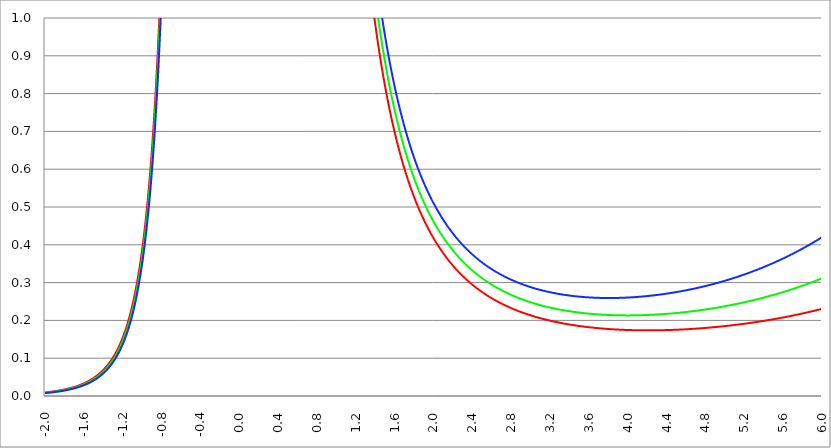
| Category | Series 1 | Series 0 | Series 2 |
|---|---|---|---|
| -2.0 | 0.009 | 0.008 | 0.008 |
| -1.996 | 0.009 | 0.009 | 0.008 |
| -1.992 | 0.01 | 0.009 | 0.008 |
| -1.988 | 0.01 | 0.009 | 0.008 |
| -1.984 | 0.01 | 0.009 | 0.008 |
| -1.98 | 0.01 | 0.009 | 0.008 |
| -1.976 | 0.01 | 0.009 | 0.008 |
| -1.972 | 0.01 | 0.009 | 0.008 |
| -1.968 | 0.01 | 0.009 | 0.008 |
| -1.964 | 0.01 | 0.009 | 0.009 |
| -1.96 | 0.011 | 0.01 | 0.009 |
| -1.956 | 0.011 | 0.01 | 0.009 |
| -1.952 | 0.011 | 0.01 | 0.009 |
| -1.948 | 0.011 | 0.01 | 0.009 |
| -1.944 | 0.011 | 0.01 | 0.009 |
| -1.94 | 0.011 | 0.01 | 0.009 |
| -1.936 | 0.011 | 0.01 | 0.009 |
| -1.932 | 0.011 | 0.01 | 0.009 |
| -1.928 | 0.012 | 0.011 | 0.01 |
| -1.924 | 0.012 | 0.011 | 0.01 |
| -1.92 | 0.012 | 0.011 | 0.01 |
| -1.916 | 0.012 | 0.011 | 0.01 |
| -1.912 | 0.012 | 0.011 | 0.01 |
| -1.908 | 0.012 | 0.011 | 0.01 |
| -1.904 | 0.012 | 0.011 | 0.01 |
| -1.9 | 0.013 | 0.011 | 0.01 |
| -1.896 | 0.013 | 0.012 | 0.011 |
| -1.892 | 0.013 | 0.012 | 0.011 |
| -1.888 | 0.013 | 0.012 | 0.011 |
| -1.884 | 0.013 | 0.012 | 0.011 |
| -1.88 | 0.013 | 0.012 | 0.011 |
| -1.876 | 0.014 | 0.012 | 0.011 |
| -1.872 | 0.014 | 0.013 | 0.011 |
| -1.868 | 0.014 | 0.013 | 0.012 |
| -1.864 | 0.014 | 0.013 | 0.012 |
| -1.86 | 0.014 | 0.013 | 0.012 |
| -1.856 | 0.014 | 0.013 | 0.012 |
| -1.852 | 0.015 | 0.013 | 0.012 |
| -1.848 | 0.015 | 0.014 | 0.012 |
| -1.844 | 0.015 | 0.014 | 0.012 |
| -1.84 | 0.015 | 0.014 | 0.013 |
| -1.836 | 0.015 | 0.014 | 0.013 |
| -1.832 | 0.016 | 0.014 | 0.013 |
| -1.828 | 0.016 | 0.014 | 0.013 |
| -1.824 | 0.016 | 0.015 | 0.013 |
| -1.82 | 0.016 | 0.015 | 0.013 |
| -1.816 | 0.016 | 0.015 | 0.014 |
| -1.812 | 0.017 | 0.015 | 0.014 |
| -1.808 | 0.017 | 0.015 | 0.014 |
| -1.804 | 0.017 | 0.016 | 0.014 |
| -1.8 | 0.017 | 0.016 | 0.014 |
| -1.796 | 0.017 | 0.016 | 0.015 |
| -1.792 | 0.018 | 0.016 | 0.015 |
| -1.788 | 0.018 | 0.016 | 0.015 |
| -1.784 | 0.018 | 0.017 | 0.015 |
| -1.78 | 0.018 | 0.017 | 0.015 |
| -1.776 | 0.019 | 0.017 | 0.016 |
| -1.772 | 0.019 | 0.017 | 0.016 |
| -1.768 | 0.019 | 0.017 | 0.016 |
| -1.764 | 0.019 | 0.018 | 0.016 |
| -1.76 | 0.02 | 0.018 | 0.016 |
| -1.756 | 0.02 | 0.018 | 0.017 |
| -1.752 | 0.02 | 0.018 | 0.017 |
| -1.748 | 0.02 | 0.019 | 0.017 |
| -1.744 | 0.021 | 0.019 | 0.017 |
| -1.74 | 0.021 | 0.019 | 0.018 |
| -1.736 | 0.021 | 0.019 | 0.018 |
| -1.732 | 0.021 | 0.02 | 0.018 |
| -1.728 | 0.022 | 0.02 | 0.018 |
| -1.724 | 0.022 | 0.02 | 0.019 |
| -1.72 | 0.022 | 0.02 | 0.019 |
| -1.716 | 0.023 | 0.021 | 0.019 |
| -1.712 | 0.023 | 0.021 | 0.019 |
| -1.708 | 0.023 | 0.021 | 0.02 |
| -1.704 | 0.024 | 0.022 | 0.02 |
| -1.7 | 0.024 | 0.022 | 0.02 |
| -1.696 | 0.024 | 0.022 | 0.02 |
| -1.692 | 0.024 | 0.022 | 0.021 |
| -1.688 | 0.025 | 0.023 | 0.021 |
| -1.684 | 0.025 | 0.023 | 0.021 |
| -1.68 | 0.025 | 0.023 | 0.022 |
| -1.676 | 0.026 | 0.024 | 0.022 |
| -1.672 | 0.026 | 0.024 | 0.022 |
| -1.668 | 0.026 | 0.024 | 0.022 |
| -1.664 | 0.027 | 0.025 | 0.023 |
| -1.66 | 0.027 | 0.025 | 0.023 |
| -1.656 | 0.028 | 0.025 | 0.023 |
| -1.652 | 0.028 | 0.026 | 0.024 |
| -1.648 | 0.028 | 0.026 | 0.024 |
| -1.644 | 0.029 | 0.026 | 0.024 |
| -1.64 | 0.029 | 0.027 | 0.025 |
| -1.636 | 0.03 | 0.027 | 0.025 |
| -1.632 | 0.03 | 0.028 | 0.025 |
| -1.628 | 0.03 | 0.028 | 0.026 |
| -1.624 | 0.031 | 0.028 | 0.026 |
| -1.62 | 0.031 | 0.029 | 0.026 |
| -1.616 | 0.032 | 0.029 | 0.027 |
| -1.612 | 0.032 | 0.03 | 0.027 |
| -1.608 | 0.032 | 0.03 | 0.028 |
| -1.604 | 0.033 | 0.03 | 0.028 |
| -1.6 | 0.033 | 0.031 | 0.028 |
| -1.596 | 0.034 | 0.031 | 0.029 |
| -1.592 | 0.034 | 0.032 | 0.029 |
| -1.588 | 0.035 | 0.032 | 0.03 |
| -1.584 | 0.035 | 0.033 | 0.03 |
| -1.58 | 0.036 | 0.033 | 0.031 |
| -1.576 | 0.036 | 0.034 | 0.031 |
| -1.572 | 0.037 | 0.034 | 0.031 |
| -1.568 | 0.037 | 0.034 | 0.032 |
| -1.564 | 0.038 | 0.035 | 0.032 |
| -1.56 | 0.038 | 0.035 | 0.033 |
| -1.556 | 0.039 | 0.036 | 0.033 |
| -1.552 | 0.039 | 0.037 | 0.034 |
| -1.548 | 0.04 | 0.037 | 0.034 |
| -1.544 | 0.041 | 0.038 | 0.035 |
| -1.54 | 0.041 | 0.038 | 0.035 |
| -1.536 | 0.042 | 0.039 | 0.036 |
| -1.532 | 0.042 | 0.039 | 0.036 |
| -1.528 | 0.043 | 0.04 | 0.037 |
| -1.524 | 0.044 | 0.04 | 0.037 |
| -1.52 | 0.044 | 0.041 | 0.038 |
| -1.516 | 0.045 | 0.042 | 0.039 |
| -1.512 | 0.045 | 0.042 | 0.039 |
| -1.508 | 0.046 | 0.043 | 0.04 |
| -1.504 | 0.047 | 0.043 | 0.04 |
| -1.5 | 0.048 | 0.044 | 0.041 |
| -1.496 | 0.048 | 0.045 | 0.042 |
| -1.492 | 0.049 | 0.045 | 0.042 |
| -1.488 | 0.05 | 0.046 | 0.043 |
| -1.484 | 0.05 | 0.047 | 0.043 |
| -1.48 | 0.051 | 0.047 | 0.044 |
| -1.476 | 0.052 | 0.048 | 0.045 |
| -1.472 | 0.053 | 0.049 | 0.045 |
| -1.467999999999999 | 0.053 | 0.05 | 0.046 |
| -1.463999999999999 | 0.054 | 0.05 | 0.047 |
| -1.459999999999999 | 0.055 | 0.051 | 0.048 |
| -1.455999999999999 | 0.056 | 0.052 | 0.048 |
| -1.451999999999999 | 0.057 | 0.053 | 0.049 |
| -1.447999999999999 | 0.057 | 0.053 | 0.05 |
| -1.443999999999999 | 0.058 | 0.054 | 0.05 |
| -1.439999999999999 | 0.059 | 0.055 | 0.051 |
| -1.435999999999999 | 0.06 | 0.056 | 0.052 |
| -1.431999999999999 | 0.061 | 0.057 | 0.053 |
| -1.427999999999999 | 0.062 | 0.058 | 0.054 |
| -1.423999999999999 | 0.063 | 0.059 | 0.055 |
| -1.419999999999999 | 0.064 | 0.059 | 0.055 |
| -1.415999999999999 | 0.065 | 0.06 | 0.056 |
| -1.411999999999999 | 0.066 | 0.061 | 0.057 |
| -1.407999999999999 | 0.067 | 0.062 | 0.058 |
| -1.403999999999999 | 0.068 | 0.063 | 0.059 |
| -1.399999999999999 | 0.069 | 0.064 | 0.06 |
| -1.395999999999999 | 0.07 | 0.065 | 0.061 |
| -1.391999999999999 | 0.071 | 0.066 | 0.062 |
| -1.387999999999999 | 0.072 | 0.067 | 0.063 |
| -1.383999999999999 | 0.073 | 0.068 | 0.064 |
| -1.379999999999999 | 0.074 | 0.069 | 0.065 |
| -1.375999999999999 | 0.075 | 0.07 | 0.066 |
| -1.371999999999999 | 0.077 | 0.072 | 0.067 |
| -1.367999999999999 | 0.078 | 0.073 | 0.068 |
| -1.363999999999999 | 0.079 | 0.074 | 0.069 |
| -1.359999999999999 | 0.08 | 0.075 | 0.07 |
| -1.355999999999999 | 0.082 | 0.076 | 0.071 |
| -1.351999999999999 | 0.083 | 0.077 | 0.072 |
| -1.347999999999999 | 0.084 | 0.079 | 0.074 |
| -1.343999999999999 | 0.085 | 0.08 | 0.075 |
| -1.339999999999999 | 0.087 | 0.081 | 0.076 |
| -1.335999999999999 | 0.088 | 0.083 | 0.077 |
| -1.331999999999999 | 0.09 | 0.084 | 0.078 |
| -1.327999999999999 | 0.091 | 0.085 | 0.08 |
| -1.323999999999999 | 0.093 | 0.087 | 0.081 |
| -1.319999999999999 | 0.094 | 0.088 | 0.082 |
| -1.315999999999999 | 0.096 | 0.089 | 0.084 |
| -1.311999999999999 | 0.097 | 0.091 | 0.085 |
| -1.307999999999999 | 0.099 | 0.092 | 0.087 |
| -1.303999999999999 | 0.1 | 0.094 | 0.088 |
| -1.299999999999999 | 0.102 | 0.095 | 0.089 |
| -1.295999999999999 | 0.103 | 0.097 | 0.091 |
| -1.291999999999999 | 0.105 | 0.099 | 0.092 |
| -1.287999999999999 | 0.107 | 0.1 | 0.094 |
| -1.283999999999999 | 0.109 | 0.102 | 0.096 |
| -1.279999999999999 | 0.11 | 0.104 | 0.097 |
| -1.275999999999999 | 0.112 | 0.105 | 0.099 |
| -1.271999999999999 | 0.114 | 0.107 | 0.1 |
| -1.267999999999999 | 0.116 | 0.109 | 0.102 |
| -1.263999999999999 | 0.118 | 0.111 | 0.104 |
| -1.259999999999999 | 0.12 | 0.113 | 0.106 |
| -1.255999999999999 | 0.122 | 0.114 | 0.107 |
| -1.251999999999999 | 0.124 | 0.116 | 0.109 |
| -1.247999999999999 | 0.126 | 0.118 | 0.111 |
| -1.243999999999999 | 0.128 | 0.12 | 0.113 |
| -1.239999999999999 | 0.13 | 0.122 | 0.115 |
| -1.235999999999999 | 0.132 | 0.124 | 0.117 |
| -1.231999999999999 | 0.135 | 0.127 | 0.119 |
| -1.227999999999999 | 0.137 | 0.129 | 0.121 |
| -1.223999999999999 | 0.139 | 0.131 | 0.123 |
| -1.219999999999999 | 0.142 | 0.133 | 0.125 |
| -1.215999999999999 | 0.144 | 0.136 | 0.128 |
| -1.211999999999999 | 0.147 | 0.138 | 0.13 |
| -1.207999999999999 | 0.149 | 0.14 | 0.132 |
| -1.203999999999999 | 0.152 | 0.143 | 0.134 |
| -1.199999999999999 | 0.154 | 0.145 | 0.137 |
| -1.195999999999999 | 0.157 | 0.148 | 0.139 |
| -1.191999999999999 | 0.16 | 0.15 | 0.142 |
| -1.187999999999999 | 0.162 | 0.153 | 0.144 |
| -1.183999999999999 | 0.165 | 0.156 | 0.147 |
| -1.179999999999999 | 0.168 | 0.158 | 0.149 |
| -1.175999999999999 | 0.171 | 0.161 | 0.152 |
| -1.171999999999999 | 0.174 | 0.164 | 0.155 |
| -1.167999999999999 | 0.177 | 0.167 | 0.158 |
| -1.163999999999999 | 0.18 | 0.17 | 0.16 |
| -1.159999999999999 | 0.183 | 0.173 | 0.163 |
| -1.155999999999999 | 0.187 | 0.176 | 0.166 |
| -1.151999999999999 | 0.19 | 0.179 | 0.169 |
| -1.147999999999999 | 0.193 | 0.183 | 0.172 |
| -1.143999999999999 | 0.197 | 0.186 | 0.176 |
| -1.139999999999999 | 0.2 | 0.189 | 0.179 |
| -1.135999999999999 | 0.204 | 0.193 | 0.182 |
| -1.131999999999999 | 0.208 | 0.196 | 0.186 |
| -1.127999999999999 | 0.212 | 0.2 | 0.189 |
| -1.123999999999999 | 0.215 | 0.204 | 0.192 |
| -1.119999999999999 | 0.219 | 0.207 | 0.196 |
| -1.115999999999999 | 0.223 | 0.211 | 0.2 |
| -1.111999999999999 | 0.227 | 0.215 | 0.203 |
| -1.107999999999999 | 0.232 | 0.219 | 0.207 |
| -1.103999999999999 | 0.236 | 0.223 | 0.211 |
| -1.099999999999999 | 0.24 | 0.227 | 0.215 |
| -1.095999999999999 | 0.245 | 0.232 | 0.219 |
| -1.091999999999999 | 0.249 | 0.236 | 0.223 |
| -1.087999999999999 | 0.254 | 0.24 | 0.228 |
| -1.083999999999999 | 0.259 | 0.245 | 0.232 |
| -1.079999999999999 | 0.263 | 0.25 | 0.236 |
| -1.075999999999999 | 0.268 | 0.254 | 0.241 |
| -1.071999999999999 | 0.273 | 0.259 | 0.246 |
| -1.067999999999999 | 0.279 | 0.264 | 0.25 |
| -1.063999999999999 | 0.284 | 0.269 | 0.255 |
| -1.059999999999999 | 0.289 | 0.274 | 0.26 |
| -1.055999999999999 | 0.295 | 0.28 | 0.265 |
| -1.051999999999999 | 0.301 | 0.285 | 0.271 |
| -1.047999999999999 | 0.306 | 0.291 | 0.276 |
| -1.043999999999999 | 0.312 | 0.296 | 0.281 |
| -1.039999999999999 | 0.318 | 0.302 | 0.287 |
| -1.035999999999999 | 0.324 | 0.308 | 0.293 |
| -1.031999999999999 | 0.331 | 0.314 | 0.298 |
| -1.027999999999999 | 0.337 | 0.32 | 0.304 |
| -1.023999999999999 | 0.344 | 0.327 | 0.31 |
| -1.019999999999999 | 0.351 | 0.333 | 0.317 |
| -1.015999999999999 | 0.357 | 0.34 | 0.323 |
| -1.011999999999999 | 0.365 | 0.347 | 0.329 |
| -1.007999999999999 | 0.372 | 0.353 | 0.336 |
| -1.003999999999999 | 0.379 | 0.361 | 0.343 |
| -0.999999999999999 | 0.387 | 0.368 | 0.35 |
| -0.995999999999999 | 0.394 | 0.375 | 0.357 |
| -0.991999999999999 | 0.402 | 0.383 | 0.364 |
| -0.987999999999999 | 0.411 | 0.391 | 0.372 |
| -0.983999999999999 | 0.419 | 0.399 | 0.38 |
| -0.979999999999999 | 0.427 | 0.407 | 0.387 |
| -0.975999999999999 | 0.436 | 0.415 | 0.395 |
| -0.971999999999999 | 0.445 | 0.424 | 0.404 |
| -0.967999999999999 | 0.454 | 0.433 | 0.412 |
| -0.963999999999999 | 0.463 | 0.442 | 0.421 |
| -0.959999999999999 | 0.473 | 0.451 | 0.43 |
| -0.955999999999999 | 0.483 | 0.46 | 0.439 |
| -0.951999999999999 | 0.493 | 0.47 | 0.448 |
| -0.947999999999999 | 0.503 | 0.48 | 0.458 |
| -0.943999999999999 | 0.514 | 0.49 | 0.467 |
| -0.939999999999999 | 0.524 | 0.5 | 0.477 |
| -0.935999999999999 | 0.535 | 0.511 | 0.488 |
| -0.931999999999999 | 0.547 | 0.522 | 0.498 |
| -0.927999999999999 | 0.558 | 0.533 | 0.509 |
| -0.923999999999999 | 0.57 | 0.545 | 0.52 |
| -0.919999999999999 | 0.582 | 0.556 | 0.531 |
| -0.915999999999999 | 0.595 | 0.568 | 0.543 |
| -0.911999999999999 | 0.608 | 0.581 | 0.555 |
| -0.907999999999999 | 0.621 | 0.593 | 0.567 |
| -0.903999999999999 | 0.634 | 0.606 | 0.58 |
| -0.899999999999999 | 0.648 | 0.62 | 0.592 |
| -0.895999999999999 | 0.662 | 0.633 | 0.606 |
| -0.891999999999999 | 0.677 | 0.647 | 0.619 |
| -0.887999999999999 | 0.692 | 0.662 | 0.633 |
| -0.883999999999999 | 0.707 | 0.677 | 0.647 |
| -0.879999999999999 | 0.723 | 0.692 | 0.662 |
| -0.875999999999999 | 0.739 | 0.707 | 0.677 |
| -0.871999999999999 | 0.755 | 0.723 | 0.692 |
| -0.867999999999999 | 0.772 | 0.74 | 0.708 |
| -0.863999999999999 | 0.79 | 0.756 | 0.724 |
| -0.859999999999999 | 0.808 | 0.774 | 0.741 |
| -0.855999999999999 | 0.826 | 0.791 | 0.758 |
| -0.851999999999999 | 0.845 | 0.81 | 0.776 |
| -0.847999999999999 | 0.864 | 0.828 | 0.794 |
| -0.843999999999999 | 0.884 | 0.847 | 0.812 |
| -0.839999999999999 | 0.904 | 0.867 | 0.831 |
| -0.835999999999999 | 0.925 | 0.887 | 0.851 |
| -0.831999999999999 | 0.947 | 0.908 | 0.871 |
| -0.827999999999999 | 0.969 | 0.93 | 0.892 |
| -0.823999999999999 | 0.992 | 0.952 | 0.913 |
| -0.819999999999999 | 1.015 | 0.974 | 0.935 |
| -0.815999999999999 | 1.039 | 0.997 | 0.957 |
| -0.811999999999999 | 1.064 | 1.021 | 0.981 |
| -0.807999999999999 | 1.089 | 1.046 | 1.004 |
| -0.803999999999999 | 1.115 | 1.071 | 1.029 |
| -0.799999999999999 | 1.142 | 1.097 | 1.054 |
| -0.795999999999999 | 1.169 | 1.124 | 1.08 |
| -0.791999999999999 | 1.198 | 1.151 | 1.106 |
| -0.787999999999999 | 1.227 | 1.179 | 1.134 |
| -0.783999999999999 | 1.257 | 1.209 | 1.162 |
| -0.779999999999999 | 1.288 | 1.238 | 1.191 |
| -0.775999999999999 | 1.319 | 1.269 | 1.221 |
| -0.771999999999999 | 1.352 | 1.301 | 1.252 |
| -0.767999999999999 | 1.386 | 1.334 | 1.283 |
| -0.763999999999999 | 1.42 | 1.367 | 1.316 |
| -0.759999999999999 | 1.456 | 1.402 | 1.35 |
| -0.755999999999999 | 1.493 | 1.437 | 1.384 |
| -0.751999999999999 | 1.531 | 1.474 | 1.42 |
| -0.747999999999999 | 1.57 | 1.512 | 1.456 |
| -0.743999999999999 | 1.61 | 1.551 | 1.494 |
| -0.739999999999999 | 1.651 | 1.591 | 1.533 |
| -0.735999999999999 | 1.694 | 1.632 | 1.573 |
| -0.731999999999999 | 1.738 | 1.675 | 1.615 |
| -0.727999999999999 | 1.783 | 1.719 | 1.658 |
| -0.723999999999999 | 1.83 | 1.764 | 1.702 |
| -0.719999999999999 | 1.878 | 1.811 | 1.747 |
| -0.715999999999999 | 1.927 | 1.859 | 1.794 |
| -0.711999999999999 | 1.978 | 1.909 | 1.842 |
| -0.707999999999999 | 2.031 | 1.961 | 1.892 |
| -0.703999999999999 | 2.086 | 2.014 | 1.944 |
| -0.699999999999999 | 2.142 | 2.068 | 1.997 |
| -0.695999999999999 | 2.2 | 2.125 | 2.052 |
| -0.691999999999999 | 2.26 | 2.183 | 2.109 |
| -0.687999999999999 | 2.322 | 2.243 | 2.167 |
| -0.683999999999999 | 2.385 | 2.305 | 2.228 |
| -0.679999999999999 | 2.451 | 2.369 | 2.29 |
| -0.675999999999999 | 2.519 | 2.436 | 2.355 |
| -0.671999999999999 | 2.59 | 2.504 | 2.422 |
| -0.667999999999999 | 2.663 | 2.575 | 2.49 |
| -0.663999999999999 | 2.738 | 2.648 | 2.562 |
| -0.659999999999999 | 2.815 | 2.724 | 2.635 |
| -0.655999999999999 | 2.896 | 2.802 | 2.712 |
| -0.651999999999999 | 2.979 | 2.883 | 2.791 |
| -0.647999999999999 | 3.064 | 2.967 | 2.872 |
| -0.643999999999999 | 3.153 | 3.053 | 2.957 |
| -0.639999999999999 | 3.245 | 3.143 | 3.044 |
| -0.635999999999999 | 3.34 | 3.236 | 3.134 |
| -0.631999999999999 | 3.439 | 3.332 | 3.228 |
| -0.627999999999999 | 3.54 | 3.431 | 3.325 |
| -0.623999999999999 | 3.646 | 3.534 | 3.425 |
| -0.619999999999999 | 3.755 | 3.641 | 3.529 |
| -0.615999999999999 | 3.868 | 3.751 | 3.637 |
| -0.611999999999999 | 3.986 | 3.866 | 3.749 |
| -0.607999999999999 | 4.107 | 3.984 | 3.865 |
| -0.603999999999999 | 4.233 | 4.107 | 3.985 |
| -0.599999999999999 | 4.364 | 4.235 | 4.11 |
| -0.595999999999999 | 4.499 | 4.367 | 4.239 |
| -0.591999999999999 | 4.639 | 4.504 | 4.373 |
| -0.587999999999999 | 4.785 | 4.646 | 4.512 |
| -0.583999999999999 | 4.936 | 4.794 | 4.656 |
| -0.579999999999999 | 5.093 | 4.948 | 4.806 |
| -0.575999999999999 | 5.256 | 5.107 | 4.962 |
| -0.571999999999999 | 5.425 | 5.272 | 5.124 |
| -0.567999999999999 | 5.601 | 5.444 | 5.292 |
| -0.563999999999999 | 5.783 | 5.623 | 5.466 |
| -0.559999999999999 | 5.973 | 5.808 | 5.648 |
| -0.555999999999999 | 6.17 | 6.001 | 5.837 |
| -0.551999999999999 | 6.375 | 6.202 | 6.033 |
| -0.547999999999999 | 6.588 | 6.41 | 6.237 |
| -0.543999999999999 | 6.81 | 6.627 | 6.45 |
| -0.539999999999999 | 7.041 | 6.853 | 6.671 |
| -0.535999999999999 | 7.281 | 7.089 | 6.901 |
| -0.531999999999999 | 7.531 | 7.333 | 7.141 |
| -0.527999999999999 | 7.792 | 7.589 | 7.391 |
| -0.523999999999999 | 8.063 | 7.854 | 7.651 |
| -0.519999999999999 | 8.345 | 8.131 | 7.922 |
| -0.515999999999999 | 8.64 | 8.42 | 8.205 |
| -0.511999999999999 | 8.947 | 8.721 | 8.5 |
| -0.507999999999999 | 9.267 | 9.035 | 8.808 |
| -0.503999999999999 | 9.601 | 9.363 | 9.13 |
| -0.499999999999999 | 9.95 | 9.704 | 9.465 |
| -0.495999999999999 | 10.314 | 10.062 | 9.815 |
| -0.491999999999999 | 10.694 | 10.434 | 10.181 |
| -0.487999999999999 | 11.091 | 10.824 | 10.563 |
| -0.483999999999999 | 11.506 | 11.231 | 10.963 |
| -0.479999999999999 | 11.94 | 11.657 | 11.38 |
| -0.475999999999999 | 12.393 | 12.102 | 11.817 |
| -0.471999999999999 | 12.868 | 12.567 | 12.274 |
| -0.467999999999999 | 13.364 | 13.055 | 12.753 |
| -0.463999999999999 | 13.883 | 13.565 | 13.254 |
| -0.459999999999999 | 14.427 | 14.099 | 13.779 |
| -0.455999999999999 | 14.997 | 14.659 | 14.328 |
| -0.451999999999999 | 15.594 | 15.246 | 14.905 |
| -0.447999999999999 | 16.22 | 15.861 | 15.509 |
| -0.443999999999999 | 16.877 | 16.506 | 16.144 |
| -0.439999999999999 | 17.565 | 17.183 | 16.809 |
| -0.435999999999999 | 18.288 | 17.894 | 17.508 |
| -0.431999999999999 | 19.047 | 18.64 | 18.242 |
| -0.427999999999999 | 19.845 | 19.424 | 19.013 |
| -0.423999999999999 | 20.682 | 20.249 | 19.824 |
| -0.419999999999999 | 21.564 | 21.115 | 20.677 |
| -0.415999999999999 | 22.49 | 22.027 | 21.574 |
| -0.411999999999999 | 23.465 | 22.987 | 22.518 |
| -0.407999999999999 | 24.492 | 23.998 | 23.513 |
| -0.403999999999999 | 25.574 | 25.062 | 24.561 |
| -0.399999999999999 | 26.713 | 26.184 | 25.666 |
| -0.395999999999999 | 27.915 | 27.368 | 26.831 |
| -0.391999999999999 | 29.183 | 28.616 | 28.061 |
| -0.387999999999999 | 30.521 | 29.934 | 29.359 |
| -0.383999999999999 | 31.933 | 31.326 | 30.73 |
| -0.379999999999999 | 33.426 | 32.797 | 32.18 |
| -0.375999999999999 | 35.004 | 34.352 | 33.712 |
| -0.371999999999999 | 36.673 | 35.997 | 35.334 |
| -0.367999999999998 | 38.44 | 37.739 | 37.051 |
| -0.363999999999998 | 40.31 | 39.583 | 38.869 |
| -0.359999999999998 | 42.292 | 41.538 | 40.797 |
| -0.355999999999998 | 44.394 | 43.611 | 42.841 |
| -0.351999999999998 | 46.623 | 45.81 | 45.011 |
| -0.347999999999998 | 48.99 | 48.145 | 47.314 |
| -0.343999999999998 | 51.504 | 50.625 | 49.762 |
| -0.339999999999998 | 54.176 | 53.263 | 52.365 |
| -0.335999999999998 | 57.019 | 56.069 | 55.135 |
| -0.331999999999998 | 60.044 | 59.056 | 58.083 |
| -0.327999999999998 | 63.267 | 62.238 | 61.226 |
| -0.323999999999998 | 66.703 | 65.631 | 64.576 |
| -0.319999999999998 | 70.368 | 69.251 | 68.152 |
| -0.315999999999998 | 74.281 | 73.116 | 71.97 |
| -0.311999999999998 | 78.462 | 77.247 | 76.051 |
| -0.307999999999998 | 82.932 | 81.665 | 80.417 |
| -0.303999999999998 | 87.717 | 86.393 | 85.09 |
| -0.299999999999998 | 92.841 | 91.459 | 90.097 |
| -0.295999999999998 | 98.335 | 96.891 | 95.467 |
| -0.291999999999998 | 104.231 | 102.72 | 101.231 |
| -0.287999999999998 | 110.562 | 108.982 | 107.424 |
| -0.283999999999998 | 117.369 | 115.714 | 114.083 |
| -0.279999999999998 | 124.694 | 122.96 | 121.251 |
| -0.275999999999998 | 132.584 | 130.767 | 128.975 |
| -0.271999999999998 | 141.092 | 139.186 | 137.306 |
| -0.267999999999998 | 150.276 | 148.276 | 146.302 |
| -0.263999999999998 | 160.2 | 158.1 | 156.026 |
| -0.259999999999998 | 170.937 | 168.729 | 166.55 |
| -0.255999999999998 | 182.566 | 180.244 | 177.952 |
| -0.251999999999998 | 195.177 | 192.733 | 190.32 |
| -0.247999999999998 | 208.869 | 206.295 | 203.753 |
| -0.243999999999998 | 223.754 | 221.041 | 218.361 |
| -0.239999999999998 | 239.958 | 237.096 | 234.268 |
| -0.235999999999998 | 257.622 | 254.6 | 251.613 |
| -0.231999999999998 | 276.904 | 273.711 | 270.554 |
| -0.227999999999998 | 297.984 | 294.606 | 291.266 |
| -0.223999999999998 | 321.063 | 317.487 | 313.951 |
| -0.219999999999998 | 346.371 | 342.582 | 338.834 |
| -0.215999999999998 | 374.169 | 370.15 | 366.174 |
| -0.211999999999998 | 404.753 | 400.485 | 396.262 |
| -0.207999999999998 | 438.46 | 433.924 | 429.434 |
| -0.203999999999998 | 475.678 | 470.851 | 466.072 |
| -0.199999999999998 | 516.849 | 511.707 | 506.615 |
| -0.195999999999998 | 562.484 | 556.998 | 551.567 |
| -0.191999999999998 | 613.168 | 607.31 | 601.508 |
| -0.187999999999998 | 669.582 | 663.317 | 657.111 |
| -0.183999999999998 | 732.511 | 725.803 | 719.156 |
| -0.179999999999998 | 802.871 | 795.677 | 788.548 |
| -0.175999999999998 | 881.729 | 874.004 | 866.347 |
| -0.171999999999998 | 970.337 | 962.028 | 953.79 |
| -0.167999999999998 | 1070.162 | 1061.21 | 1052.333 |
| -0.163999999999998 | 1182.937 | 1173.276 | 1163.695 |
| -0.159999999999998 | 1310.712 | 1300.268 | 1289.908 |
| -0.155999999999998 | 1455.926 | 1444.613 | 1433.389 |
| -0.151999999999998 | 1621.487 | 1609.211 | 1597.027 |
| -0.147999999999998 | 1810.887 | 1797.536 | 1784.283 |
| -0.143999999999998 | 2028.33 | 2013.778 | 1999.331 |
| -0.139999999999998 | 2278.907 | 2263.011 | 2247.225 |
| -0.135999999999998 | 2568.819 | 2551.41 | 2534.12 |
| -0.131999999999998 | 2905.653 | 2886.539 | 2867.55 |
| -0.127999999999998 | 3298.754 | 3277.709 | 3256.799 |
| -0.123999999999998 | 3759.702 | 3736.463 | 3713.369 |
| -0.119999999999998 | 4302.942 | 4277.201 | 4251.615 |
| -0.115999999999998 | 4946.623 | 4918.015 | 4889.573 |
| -0.111999999999998 | 5713.72 | 5681.813 | 5650.084 |
| -0.107999999999998 | 6633.555 | 6597.831 | 6562.299 |
| -0.103999999999998 | 7743.875 | 7703.712 | 7663.756 |
| -0.0999999999999983 | 9093.729 | 9048.374 | 9003.245 |
| -0.0959999999999983 | 10747.499 | 10696.035 | 10644.817 |
| -0.0919999999999983 | 12790.613 | 12731.911 | 12673.479 |
| -0.0879999999999983 | 15337.773 | 15270.435 | 15203.392 |
| -0.0839999999999983 | 18544.971 | 18467.245 | 18389.846 |
| -0.0799999999999983 | 22627.349 | 22537.02 | 22447.052 |
| -0.0759999999999983 | 27886.215 | 27780.448 | 27675.083 |
| -0.0719999999999983 | 34750.757 | 34625.879 | 34501.45 |
| -0.0679999999999983 | 43843.874 | 43695.058 | 43546.748 |
| -0.0639999999999983 | 56088.652 | 55909.455 | 55730.83 |
| -0.0599999999999983 | 72885.345 | 72667.016 | 72449.342 |
| -0.0559999999999983 | 96414.738 | 96145.154 | 95876.324 |
| -0.0519999999999983 | 130176.466 | 129838.447 | 129501.306 |
| -0.0479999999999983 | 179982.89 | 179551.449 | 179121.043 |
| -0.0439999999999983 | 255879.672 | 255317.355 | 254756.274 |
| -0.0399999999999983 | 376059.743 | 375308.375 | 374558.508 |
| -0.0359999999999982 | 575356.635 | 574321.924 | 573289.075 |
| -0.0319999999999982 | 925118.859 | 923639.853 | 922163.21 |
| -0.0279999999999982 | 1584220.546 | 1582004.189 | 1579790.933 |
| -0.0239999999999982 | 2946138.225 | 2942604.98 | 2939075.972 |
| -0.0199999999999982 | 6132371.014 | 6126241.708 | 6120118.529 |
| -0.0159999999999982 | 15028609.267 | 15016591.187 | 15004582.718 |
| -0.0119999999999982 | 47678661.93 | 47650063.313 | 47621481.851 |
| -0.00799999999999825 | 242292189.203 | 242195291.708 | 242098432.965 |
| -0.00399999999999825 | 3891434417.442 | 3890656208.382 | 3889878154.948 |
| 1.74860126378462e-15 | 106963806150279995626550861657598610163713674150119408140288 | 106963806150279995626550861657598610163713674150119408140288 | 106963806150279995626550861657598610163713674150119408140288 |
| 0.00400000000000175 | 3921121988.876 | 3921906291.702 | 3922690751.403 |
| 0.00800000000000175 | 246003162.427 | 246101583.375 | 246200043.699 |
| 0.0120000000000017 | 48778222.783 | 48807498.499 | 48836791.785 |
| 0.0160000000000017 | 15492494.317 | 15504893.271 | 15517302.148 |
| 0.0200000000000017 | 6369885.304 | 6376258.375 | 6382637.823 |
| 0.0240000000000017 | 3083592.263 | 3087294.795 | 3091001.772 |
| 0.0280000000000017 | 1670783.231 | 1673123.966 | 1675467.98 |
| 0.0320000000000017 | 983111.189 | 984685.426 | 986262.184 |
| 0.0360000000000017 | 616088.168 | 617198.125 | 618310.082 |
| 0.0400000000000017 | 405754.388 | 406566.709 | 407380.656 |
| 0.0440000000000018 | 278190.826 | 278803.519 | 279417.562 |
| 0.0480000000000018 | 197169.111 | 197642.885 | 198117.798 |
| 0.0520000000000018 | 143694.708 | 144068.8 | 144443.866 |
| 0.0560000000000018 | 107238.902 | 107539.592 | 107841.124 |
| 0.0600000000000018 | 81686.405 | 81931.832 | 82177.997 |
| 0.0640000000000018 | 63341.043 | 63544.059 | 63747.725 |
| 0.0680000000000018 | 49890.72 | 50060.637 | 50231.133 |
| 0.0720000000000018 | 39845.177 | 39988.878 | 40133.097 |
| 0.0760000000000018 | 32218.231 | 32340.893 | 32464.022 |
| 0.0800000000000018 | 26341.86 | 26447.438 | 26553.44 |
| 0.0840000000000018 | 21754.022 | 21845.581 | 21937.525 |
| 0.0880000000000018 | 18129.104 | 18209.047 | 18289.344 |
| 0.0920000000000018 | 15233.722 | 15303.959 | 15374.519 |
| 0.0960000000000018 | 12898.01 | 12960.07 | 13022.428 |
| 0.100000000000002 | 10996.589 | 11051.709 | 11107.106 |
| 0.104000000000002 | 9435.718 | 9484.911 | 9534.361 |
| 0.108000000000002 | 8144.484 | 8188.584 | 8232.921 |
| 0.112000000000002 | 7068.656 | 7108.351 | 7148.27 |
| 0.116000000000002 | 6166.338 | 6202.206 | 6238.284 |
| 0.120000000000002 | 5404.862 | 5437.388 | 5470.111 |
| 0.124000000000002 | 4758.534 | 4788.128 | 4817.907 |
| 0.128000000000002 | 4206.979 | 4233.99 | 4261.174 |
| 0.132000000000002 | 3733.918 | 3758.644 | 3783.533 |
| 0.136000000000002 | 3326.252 | 3348.948 | 3371.799 |
| 0.140000000000002 | 2973.37 | 2994.257 | 3015.29 |
| 0.144000000000002 | 2666.622 | 2685.891 | 2705.3 |
| 0.148000000000002 | 2398.915 | 2416.733 | 2434.683 |
| 0.152000000000002 | 2164.401 | 2180.913 | 2197.551 |
| 0.156000000000002 | 1958.232 | 1973.566 | 1989.02 |
| 0.160000000000002 | 1776.368 | 1790.635 | 1805.018 |
| 0.164000000000002 | 1615.428 | 1628.729 | 1642.14 |
| 0.168000000000002 | 1472.571 | 1484.993 | 1497.519 |
| 0.172000000000002 | 1345.395 | 1357.016 | 1368.736 |
| 0.176000000000002 | 1231.866 | 1242.754 | 1253.738 |
| 0.180000000000002 | 1130.25 | 1140.468 | 1150.778 |
| 0.184000000000002 | 1039.067 | 1048.67 | 1058.362 |
| 0.188000000000002 | 957.048 | 966.086 | 975.21 |
| 0.192000000000002 | 883.101 | 891.62 | 900.22 |
| 0.196000000000002 | 816.284 | 824.323 | 832.441 |
| 0.200000000000002 | 755.781 | 763.377 | 771.049 |
| 0.204000000000002 | 700.883 | 708.069 | 715.328 |
| 0.208000000000002 | 650.973 | 657.779 | 664.655 |
| 0.212000000000002 | 605.513 | 611.966 | 618.487 |
| 0.216000000000002 | 564.03 | 570.155 | 576.346 |
| 0.220000000000002 | 526.11 | 531.929 | 537.813 |
| 0.224000000000002 | 491.389 | 496.924 | 502.521 |
| 0.228000000000002 | 459.546 | 464.815 | 470.144 |
| 0.232000000000002 | 430.295 | 435.316 | 440.395 |
| 0.236000000000002 | 403.386 | 408.174 | 413.019 |
| 0.240000000000002 | 378.594 | 383.165 | 387.791 |
| 0.244000000000002 | 355.722 | 360.088 | 364.508 |
| 0.248000000000002 | 334.59 | 338.765 | 342.992 |
| 0.252000000000002 | 315.042 | 319.036 | 323.082 |
| 0.256000000000002 | 296.934 | 300.76 | 304.634 |
| 0.260000000000002 | 280.141 | 283.807 | 287.521 |
| 0.264000000000002 | 264.549 | 268.064 | 271.626 |
| 0.268000000000002 | 250.053 | 253.426 | 256.845 |
| 0.272000000000002 | 236.563 | 239.802 | 243.085 |
| 0.276000000000002 | 223.994 | 227.106 | 230.262 |
| 0.280000000000002 | 212.271 | 215.263 | 218.298 |
| 0.284000000000002 | 201.326 | 204.205 | 207.125 |
| 0.288000000000002 | 191.097 | 193.868 | 196.68 |
| 0.292000000000002 | 181.527 | 184.197 | 186.906 |
| 0.296000000000002 | 172.567 | 175.14 | 177.751 |
| 0.300000000000002 | 164.168 | 166.649 | 169.168 |
| 0.304000000000002 | 156.29 | 158.683 | 161.114 |
| 0.308000000000002 | 148.892 | 151.203 | 153.549 |
| 0.312000000000002 | 141.941 | 144.172 | 146.439 |
| 0.316000000000002 | 135.403 | 137.559 | 139.75 |
| 0.320000000000002 | 129.249 | 131.333 | 133.451 |
| 0.324000000000002 | 123.451 | 125.468 | 127.517 |
| 0.328000000000002 | 117.986 | 119.937 | 121.92 |
| 0.332000000000002 | 112.83 | 114.718 | 116.639 |
| 0.336000000000002 | 107.962 | 109.791 | 111.651 |
| 0.340000000000002 | 103.362 | 105.134 | 106.937 |
| 0.344000000000002 | 99.013 | 100.731 | 102.479 |
| 0.348000000000002 | 94.899 | 96.565 | 98.259 |
| 0.352000000000002 | 91.003 | 92.619 | 94.264 |
| 0.356000000000002 | 87.313 | 88.881 | 90.477 |
| 0.360000000000002 | 83.814 | 85.337 | 86.887 |
| 0.364000000000002 | 80.496 | 81.974 | 83.48 |
| 0.368000000000002 | 77.346 | 78.782 | 80.245 |
| 0.372000000000002 | 74.355 | 75.751 | 77.173 |
| 0.376000000000002 | 71.512 | 72.869 | 74.252 |
| 0.380000000000002 | 68.809 | 70.129 | 71.474 |
| 0.384000000000002 | 66.238 | 67.522 | 68.831 |
| 0.388000000000002 | 63.79 | 65.04 | 66.314 |
| 0.392000000000002 | 61.459 | 62.676 | 63.916 |
| 0.396000000000002 | 59.238 | 60.423 | 61.631 |
| 0.400000000000002 | 57.12 | 58.274 | 59.452 |
| 0.404000000000002 | 55.101 | 56.225 | 57.372 |
| 0.408000000000002 | 53.173 | 54.269 | 55.387 |
| 0.412000000000002 | 51.333 | 52.401 | 53.492 |
| 0.416000000000002 | 49.575 | 50.617 | 51.68 |
| 0.420000000000002 | 47.895 | 48.911 | 49.949 |
| 0.424000000000002 | 46.288 | 47.28 | 48.293 |
| 0.428000000000002 | 44.752 | 45.72 | 46.709 |
| 0.432000000000002 | 43.281 | 44.226 | 45.192 |
| 0.436000000000002 | 41.873 | 42.796 | 43.74 |
| 0.440000000000002 | 40.525 | 41.427 | 42.348 |
| 0.444000000000002 | 39.233 | 40.114 | 41.014 |
| 0.448000000000002 | 37.995 | 38.855 | 39.736 |
| 0.452000000000002 | 36.807 | 37.648 | 38.509 |
| 0.456000000000002 | 35.668 | 36.49 | 37.332 |
| 0.460000000000002 | 34.574 | 35.379 | 36.202 |
| 0.464000000000002 | 33.525 | 34.312 | 35.117 |
| 0.468000000000002 | 32.517 | 33.286 | 34.074 |
| 0.472000000000002 | 31.548 | 32.301 | 33.073 |
| 0.476000000000002 | 30.617 | 31.354 | 32.109 |
| 0.480000000000002 | 29.722 | 30.444 | 31.183 |
| 0.484000000000002 | 28.861 | 29.568 | 30.292 |
| 0.488000000000002 | 28.032 | 28.725 | 29.434 |
| 0.492000000000002 | 27.235 | 27.913 | 28.609 |
| 0.496000000000002 | 26.467 | 27.132 | 27.813 |
| 0.500000000000002 | 25.728 | 26.38 | 27.047 |
| 0.504000000000002 | 25.016 | 25.654 | 26.309 |
| 0.508000000000002 | 24.33 | 24.956 | 25.598 |
| 0.512000000000002 | 23.668 | 24.282 | 24.911 |
| 0.516000000000002 | 23.03 | 23.632 | 24.249 |
| 0.520000000000002 | 22.414 | 23.005 | 23.611 |
| 0.524000000000002 | 21.821 | 22.4 | 22.994 |
| 0.528000000000002 | 21.247 | 21.816 | 22.399 |
| 0.532000000000002 | 20.694 | 21.252 | 21.825 |
| 0.536000000000002 | 20.16 | 20.707 | 21.27 |
| 0.540000000000002 | 19.643 | 20.181 | 20.733 |
| 0.544000000000002 | 19.145 | 19.673 | 20.215 |
| 0.548000000000002 | 18.663 | 19.181 | 19.714 |
| 0.552000000000002 | 18.196 | 18.706 | 19.229 |
| 0.556000000000002 | 17.746 | 18.246 | 18.76 |
| 0.560000000000002 | 17.31 | 17.801 | 18.307 |
| 0.564000000000002 | 16.888 | 17.371 | 17.868 |
| 0.568000000000002 | 16.48 | 16.955 | 17.443 |
| 0.572000000000002 | 16.085 | 16.551 | 17.032 |
| 0.576000000000002 | 15.702 | 16.161 | 16.633 |
| 0.580000000000002 | 15.331 | 15.783 | 16.247 |
| 0.584000000000002 | 14.973 | 15.416 | 15.873 |
| 0.588000000000002 | 14.625 | 15.061 | 15.51 |
| 0.592000000000002 | 14.288 | 14.717 | 15.159 |
| 0.596000000000002 | 13.961 | 14.383 | 14.818 |
| 0.600000000000002 | 13.644 | 14.06 | 14.488 |
| 0.604000000000002 | 13.337 | 13.746 | 14.167 |
| 0.608000000000002 | 13.039 | 13.441 | 13.856 |
| 0.612000000000002 | 12.749 | 13.146 | 13.554 |
| 0.616000000000002 | 12.469 | 12.859 | 13.261 |
| 0.620000000000002 | 12.196 | 12.58 | 12.977 |
| 0.624000000000002 | 11.932 | 12.31 | 12.7 |
| 0.628000000000002 | 11.675 | 12.048 | 12.432 |
| 0.632000000000002 | 11.426 | 11.792 | 12.171 |
| 0.636000000000002 | 11.183 | 11.545 | 11.918 |
| 0.640000000000002 | 10.948 | 11.304 | 11.671 |
| 0.644000000000002 | 10.719 | 11.07 | 11.432 |
| 0.648000000000002 | 10.497 | 10.842 | 11.199 |
| 0.652000000000002 | 10.28 | 10.621 | 10.973 |
| 0.656000000000002 | 10.07 | 10.406 | 10.753 |
| 0.660000000000002 | 9.866 | 10.197 | 10.539 |
| 0.664000000000002 | 9.667 | 9.993 | 10.33 |
| 0.668000000000002 | 9.473 | 9.795 | 10.128 |
| 0.672000000000002 | 9.285 | 9.602 | 9.93 |
| 0.676000000000002 | 9.102 | 9.414 | 9.738 |
| 0.680000000000002 | 8.923 | 9.232 | 9.551 |
| 0.684000000000002 | 8.749 | 9.054 | 9.369 |
| 0.688000000000002 | 8.58 | 8.881 | 9.191 |
| 0.692000000000002 | 8.416 | 8.712 | 9.018 |
| 0.696000000000002 | 8.255 | 8.547 | 8.85 |
| 0.700000000000002 | 8.099 | 8.387 | 8.686 |
| 0.704000000000002 | 7.946 | 8.231 | 8.526 |
| 0.708000000000002 | 7.798 | 8.079 | 8.37 |
| 0.712000000000002 | 7.653 | 7.93 | 8.218 |
| 0.716000000000002 | 7.512 | 7.786 | 8.07 |
| 0.720000000000002 | 7.374 | 7.645 | 7.925 |
| 0.724000000000002 | 7.24 | 7.507 | 7.784 |
| 0.728000000000002 | 7.109 | 7.373 | 7.646 |
| 0.732000000000002 | 6.982 | 7.242 | 7.512 |
| 0.736000000000002 | 6.857 | 7.114 | 7.381 |
| 0.740000000000002 | 6.736 | 6.99 | 7.253 |
| 0.744000000000002 | 6.617 | 6.868 | 7.128 |
| 0.748000000000002 | 6.501 | 6.749 | 7.006 |
| 0.752000000000002 | 6.388 | 6.633 | 6.887 |
| 0.756000000000002 | 6.278 | 6.52 | 6.771 |
| 0.760000000000002 | 6.17 | 6.409 | 6.658 |
| 0.764000000000002 | 6.065 | 6.301 | 6.547 |
| 0.768000000000002 | 5.962 | 6.196 | 6.438 |
| 0.772000000000002 | 5.862 | 6.093 | 6.332 |
| 0.776000000000002 | 5.764 | 5.992 | 6.229 |
| 0.780000000000002 | 5.668 | 5.893 | 6.128 |
| 0.784000000000002 | 5.574 | 5.797 | 6.029 |
| 0.788000000000002 | 5.483 | 5.703 | 5.932 |
| 0.792000000000002 | 5.393 | 5.611 | 5.838 |
| 0.796000000000002 | 5.306 | 5.521 | 5.746 |
| 0.800000000000002 | 5.22 | 5.433 | 5.655 |
| 0.804000000000002 | 5.137 | 5.347 | 5.567 |
| 0.808000000000002 | 5.055 | 5.263 | 5.48 |
| 0.812000000000002 | 4.975 | 5.181 | 5.396 |
| 0.816000000000002 | 4.897 | 5.101 | 5.313 |
| 0.820000000000002 | 4.82 | 5.022 | 5.232 |
| 0.824000000000002 | 4.745 | 4.945 | 5.153 |
| 0.828000000000002 | 4.672 | 4.869 | 5.075 |
| 0.832000000000002 | 4.6 | 4.796 | 4.999 |
| 0.836000000000002 | 4.53 | 4.723 | 4.925 |
| 0.840000000000002 | 4.461 | 4.653 | 4.852 |
| 0.844000000000002 | 4.394 | 4.583 | 4.781 |
| 0.848000000000002 | 4.328 | 4.515 | 4.711 |
| 0.852000000000002 | 4.263 | 4.449 | 4.643 |
| 0.856000000000002 | 4.2 | 4.384 | 4.576 |
| 0.860000000000002 | 4.138 | 4.32 | 4.51 |
| 0.864000000000002 | 4.078 | 4.258 | 4.446 |
| 0.868000000000002 | 4.018 | 4.197 | 4.383 |
| 0.872000000000002 | 3.96 | 4.137 | 4.321 |
| 0.876000000000002 | 3.903 | 4.078 | 4.26 |
| 0.880000000000002 | 3.847 | 4.02 | 4.201 |
| 0.884000000000002 | 3.792 | 3.964 | 4.143 |
| 0.888000000000002 | 3.739 | 3.908 | 4.086 |
| 0.892000000000002 | 3.686 | 3.854 | 4.03 |
| 0.896000000000002 | 3.634 | 3.801 | 3.975 |
| 0.900000000000002 | 3.584 | 3.749 | 3.921 |
| 0.904000000000002 | 3.534 | 3.698 | 3.869 |
| 0.908000000000002 | 3.486 | 3.648 | 3.817 |
| 0.912000000000002 | 3.438 | 3.598 | 3.766 |
| 0.916000000000002 | 3.391 | 3.55 | 3.716 |
| 0.920000000000002 | 3.345 | 3.503 | 3.668 |
| 0.924000000000002 | 3.3 | 3.456 | 3.62 |
| 0.928000000000002 | 3.256 | 3.411 | 3.573 |
| 0.932000000000002 | 3.213 | 3.366 | 3.526 |
| 0.936000000000002 | 3.17 | 3.322 | 3.481 |
| 0.940000000000002 | 3.128 | 3.279 | 3.437 |
| 0.944000000000002 | 3.087 | 3.237 | 3.393 |
| 0.948000000000002 | 3.047 | 3.195 | 3.35 |
| 0.952000000000002 | 3.008 | 3.154 | 3.308 |
| 0.956000000000002 | 2.969 | 3.114 | 3.267 |
| 0.960000000000002 | 2.931 | 3.075 | 3.226 |
| 0.964000000000002 | 2.893 | 3.036 | 3.186 |
| 0.968000000000002 | 2.857 | 2.998 | 3.147 |
| 0.972000000000002 | 2.821 | 2.961 | 3.109 |
| 0.976000000000003 | 2.785 | 2.925 | 3.071 |
| 0.980000000000002 | 2.751 | 2.889 | 3.034 |
| 0.984000000000003 | 2.716 | 2.853 | 2.997 |
| 0.988000000000003 | 2.683 | 2.819 | 2.961 |
| 0.992000000000002 | 2.65 | 2.785 | 2.926 |
| 0.996000000000003 | 2.618 | 2.751 | 2.892 |
| 1.000000000000002 | 2.586 | 2.718 | 2.858 |
| 1.004000000000002 | 2.554 | 2.686 | 2.824 |
| 1.008000000000002 | 2.524 | 2.654 | 2.791 |
| 1.012000000000002 | 2.493 | 2.623 | 2.759 |
| 1.016000000000002 | 2.464 | 2.592 | 2.727 |
| 1.020000000000002 | 2.435 | 2.562 | 2.696 |
| 1.024000000000002 | 2.406 | 2.532 | 2.665 |
| 1.028000000000002 | 2.378 | 2.503 | 2.635 |
| 1.032000000000002 | 2.35 | 2.474 | 2.605 |
| 1.036000000000002 | 2.323 | 2.446 | 2.576 |
| 1.040000000000002 | 2.296 | 2.418 | 2.548 |
| 1.044000000000002 | 2.27 | 2.391 | 2.519 |
| 1.048000000000002 | 2.244 | 2.364 | 2.491 |
| 1.052000000000002 | 2.218 | 2.338 | 2.464 |
| 1.056000000000002 | 2.193 | 2.312 | 2.437 |
| 1.060000000000002 | 2.168 | 2.286 | 2.411 |
| 1.064000000000002 | 2.144 | 2.261 | 2.385 |
| 1.068000000000002 | 2.12 | 2.236 | 2.359 |
| 1.072000000000002 | 2.097 | 2.212 | 2.334 |
| 1.076000000000003 | 2.073 | 2.188 | 2.309 |
| 1.080000000000002 | 2.051 | 2.164 | 2.285 |
| 1.084000000000003 | 2.028 | 2.141 | 2.26 |
| 1.088000000000003 | 2.006 | 2.118 | 2.237 |
| 1.092000000000002 | 1.984 | 2.096 | 2.213 |
| 1.096000000000003 | 1.963 | 2.074 | 2.191 |
| 1.100000000000003 | 1.942 | 2.052 | 2.168 |
| 1.104000000000003 | 1.921 | 2.03 | 2.146 |
| 1.108000000000003 | 1.901 | 2.009 | 2.124 |
| 1.112000000000003 | 1.881 | 1.988 | 2.102 |
| 1.116000000000003 | 1.861 | 1.968 | 2.081 |
| 1.120000000000003 | 1.842 | 1.948 | 2.06 |
| 1.124000000000003 | 1.823 | 1.928 | 2.039 |
| 1.128000000000003 | 1.804 | 1.908 | 2.019 |
| 1.132000000000003 | 1.785 | 1.889 | 1.999 |
| 1.136000000000003 | 1.767 | 1.87 | 1.979 |
| 1.140000000000003 | 1.749 | 1.851 | 1.96 |
| 1.144000000000003 | 1.731 | 1.833 | 1.941 |
| 1.148000000000003 | 1.713 | 1.815 | 1.922 |
| 1.152000000000003 | 1.696 | 1.797 | 1.903 |
| 1.156000000000003 | 1.679 | 1.779 | 1.885 |
| 1.160000000000003 | 1.662 | 1.762 | 1.867 |
| 1.164000000000003 | 1.646 | 1.745 | 1.849 |
| 1.168000000000003 | 1.63 | 1.728 | 1.832 |
| 1.172000000000003 | 1.614 | 1.711 | 1.814 |
| 1.176000000000003 | 1.598 | 1.695 | 1.797 |
| 1.180000000000003 | 1.582 | 1.679 | 1.781 |
| 1.184000000000003 | 1.567 | 1.663 | 1.764 |
| 1.188000000000003 | 1.552 | 1.647 | 1.748 |
| 1.192000000000003 | 1.537 | 1.631 | 1.732 |
| 1.196000000000003 | 1.522 | 1.616 | 1.716 |
| 1.200000000000003 | 1.508 | 1.601 | 1.7 |
| 1.204000000000003 | 1.494 | 1.586 | 1.685 |
| 1.208000000000003 | 1.48 | 1.572 | 1.67 |
| 1.212000000000003 | 1.466 | 1.557 | 1.655 |
| 1.216000000000003 | 1.452 | 1.543 | 1.64 |
| 1.220000000000003 | 1.438 | 1.529 | 1.625 |
| 1.224000000000003 | 1.425 | 1.515 | 1.611 |
| 1.228000000000003 | 1.412 | 1.501 | 1.597 |
| 1.232000000000003 | 1.399 | 1.488 | 1.583 |
| 1.236000000000003 | 1.386 | 1.475 | 1.569 |
| 1.240000000000003 | 1.374 | 1.462 | 1.555 |
| 1.244000000000003 | 1.361 | 1.449 | 1.542 |
| 1.248000000000003 | 1.349 | 1.436 | 1.528 |
| 1.252000000000003 | 1.337 | 1.423 | 1.515 |
| 1.256000000000003 | 1.325 | 1.411 | 1.502 |
| 1.260000000000003 | 1.313 | 1.399 | 1.49 |
| 1.264000000000003 | 1.302 | 1.387 | 1.477 |
| 1.268000000000003 | 1.29 | 1.375 | 1.465 |
| 1.272000000000003 | 1.279 | 1.363 | 1.452 |
| 1.276000000000003 | 1.268 | 1.351 | 1.44 |
| 1.280000000000003 | 1.257 | 1.34 | 1.428 |
| 1.284000000000003 | 1.246 | 1.329 | 1.417 |
| 1.288000000000003 | 1.235 | 1.317 | 1.405 |
| 1.292000000000003 | 1.225 | 1.306 | 1.394 |
| 1.296000000000003 | 1.214 | 1.295 | 1.382 |
| 1.300000000000003 | 1.204 | 1.285 | 1.371 |
| 1.304000000000003 | 1.194 | 1.274 | 1.36 |
| 1.308000000000003 | 1.184 | 1.264 | 1.349 |
| 1.312000000000003 | 1.174 | 1.253 | 1.338 |
| 1.316000000000003 | 1.164 | 1.243 | 1.328 |
| 1.320000000000003 | 1.154 | 1.233 | 1.317 |
| 1.324000000000003 | 1.145 | 1.223 | 1.307 |
| 1.328000000000003 | 1.135 | 1.213 | 1.297 |
| 1.332000000000003 | 1.126 | 1.204 | 1.286 |
| 1.336000000000003 | 1.117 | 1.194 | 1.276 |
| 1.340000000000003 | 1.108 | 1.185 | 1.267 |
| 1.344000000000003 | 1.099 | 1.175 | 1.257 |
| 1.348000000000003 | 1.09 | 1.166 | 1.247 |
| 1.352000000000003 | 1.081 | 1.157 | 1.238 |
| 1.356000000000003 | 1.073 | 1.148 | 1.228 |
| 1.360000000000003 | 1.064 | 1.139 | 1.219 |
| 1.364000000000003 | 1.056 | 1.13 | 1.21 |
| 1.368000000000003 | 1.047 | 1.121 | 1.201 |
| 1.372000000000003 | 1.039 | 1.113 | 1.192 |
| 1.376000000000003 | 1.031 | 1.104 | 1.183 |
| 1.380000000000003 | 1.023 | 1.096 | 1.174 |
| 1.384000000000003 | 1.015 | 1.088 | 1.166 |
| 1.388000000000003 | 1.007 | 1.08 | 1.157 |
| 1.392000000000003 | 0.999 | 1.071 | 1.149 |
| 1.396000000000003 | 0.992 | 1.063 | 1.14 |
| 1.400000000000003 | 0.984 | 1.056 | 1.132 |
| 1.404000000000003 | 0.977 | 1.048 | 1.124 |
| 1.408000000000003 | 0.969 | 1.04 | 1.116 |
| 1.412000000000003 | 0.962 | 1.032 | 1.108 |
| 1.416000000000003 | 0.955 | 1.025 | 1.1 |
| 1.420000000000003 | 0.948 | 1.018 | 1.092 |
| 1.424000000000003 | 0.941 | 1.01 | 1.085 |
| 1.428000000000003 | 0.934 | 1.003 | 1.077 |
| 1.432000000000003 | 0.927 | 0.996 | 1.07 |
| 1.436000000000003 | 0.92 | 0.989 | 1.062 |
| 1.440000000000003 | 0.913 | 0.982 | 1.055 |
| 1.444000000000003 | 0.907 | 0.975 | 1.048 |
| 1.448000000000003 | 0.9 | 0.968 | 1.04 |
| 1.452000000000003 | 0.894 | 0.961 | 1.033 |
| 1.456000000000003 | 0.887 | 0.954 | 1.026 |
| 1.460000000000003 | 0.881 | 0.948 | 1.019 |
| 1.464000000000003 | 0.875 | 0.941 | 1.013 |
| 1.468000000000003 | 0.868 | 0.935 | 1.006 |
| 1.472000000000003 | 0.862 | 0.928 | 0.999 |
| 1.476000000000003 | 0.856 | 0.922 | 0.992 |
| 1.480000000000003 | 0.85 | 0.916 | 0.986 |
| 1.484000000000003 | 0.844 | 0.909 | 0.979 |
| 1.488000000000003 | 0.839 | 0.903 | 0.973 |
| 1.492000000000003 | 0.833 | 0.897 | 0.967 |
| 1.496000000000003 | 0.827 | 0.891 | 0.96 |
| 1.500000000000003 | 0.821 | 0.885 | 0.954 |
| 1.504000000000003 | 0.816 | 0.879 | 0.948 |
| 1.508000000000003 | 0.81 | 0.874 | 0.942 |
| 1.512000000000003 | 0.805 | 0.868 | 0.936 |
| 1.516000000000003 | 0.799 | 0.862 | 0.93 |
| 1.520000000000003 | 0.794 | 0.857 | 0.924 |
| 1.524000000000003 | 0.789 | 0.851 | 0.918 |
| 1.528000000000003 | 0.783 | 0.845 | 0.913 |
| 1.532000000000003 | 0.778 | 0.84 | 0.907 |
| 1.536000000000003 | 0.773 | 0.835 | 0.901 |
| 1.540000000000003 | 0.768 | 0.829 | 0.896 |
| 1.544000000000003 | 0.763 | 0.824 | 0.89 |
| 1.548000000000003 | 0.758 | 0.819 | 0.885 |
| 1.552000000000003 | 0.753 | 0.814 | 0.879 |
| 1.556000000000003 | 0.748 | 0.809 | 0.874 |
| 1.560000000000003 | 0.743 | 0.804 | 0.869 |
| 1.564000000000003 | 0.738 | 0.799 | 0.863 |
| 1.568000000000003 | 0.734 | 0.794 | 0.858 |
| 1.572000000000003 | 0.729 | 0.789 | 0.853 |
| 1.576000000000003 | 0.724 | 0.784 | 0.848 |
| 1.580000000000003 | 0.72 | 0.779 | 0.843 |
| 1.584000000000003 | 0.715 | 0.774 | 0.838 |
| 1.588000000000003 | 0.711 | 0.77 | 0.833 |
| 1.592000000000003 | 0.706 | 0.765 | 0.828 |
| 1.596000000000003 | 0.702 | 0.76 | 0.823 |
| 1.600000000000003 | 0.698 | 0.756 | 0.819 |
| 1.604000000000003 | 0.693 | 0.751 | 0.814 |
| 1.608000000000003 | 0.689 | 0.747 | 0.809 |
| 1.612000000000003 | 0.685 | 0.742 | 0.805 |
| 1.616000000000003 | 0.681 | 0.738 | 0.8 |
| 1.620000000000003 | 0.677 | 0.734 | 0.796 |
| 1.624000000000003 | 0.672 | 0.729 | 0.791 |
| 1.628000000000003 | 0.668 | 0.725 | 0.787 |
| 1.632000000000003 | 0.664 | 0.721 | 0.782 |
| 1.636000000000003 | 0.66 | 0.717 | 0.778 |
| 1.640000000000003 | 0.657 | 0.713 | 0.774 |
| 1.644000000000003 | 0.653 | 0.709 | 0.769 |
| 1.648000000000003 | 0.649 | 0.705 | 0.765 |
| 1.652000000000003 | 0.645 | 0.701 | 0.761 |
| 1.656000000000003 | 0.641 | 0.697 | 0.757 |
| 1.660000000000003 | 0.637 | 0.693 | 0.753 |
| 1.664000000000003 | 0.634 | 0.689 | 0.748 |
| 1.668000000000003 | 0.63 | 0.685 | 0.744 |
| 1.672000000000003 | 0.626 | 0.681 | 0.74 |
| 1.676000000000003 | 0.623 | 0.677 | 0.737 |
| 1.680000000000003 | 0.619 | 0.674 | 0.733 |
| 1.684000000000003 | 0.616 | 0.67 | 0.729 |
| 1.688000000000003 | 0.612 | 0.666 | 0.725 |
| 1.692000000000003 | 0.609 | 0.663 | 0.721 |
| 1.696000000000003 | 0.605 | 0.659 | 0.717 |
| 1.700000000000003 | 0.602 | 0.655 | 0.714 |
| 1.704000000000003 | 0.599 | 0.652 | 0.71 |
| 1.708000000000003 | 0.595 | 0.648 | 0.706 |
| 1.712000000000003 | 0.592 | 0.645 | 0.703 |
| 1.716000000000003 | 0.589 | 0.641 | 0.699 |
| 1.720000000000003 | 0.585 | 0.638 | 0.695 |
| 1.724000000000003 | 0.582 | 0.635 | 0.692 |
| 1.728000000000003 | 0.579 | 0.631 | 0.688 |
| 1.732000000000003 | 0.576 | 0.628 | 0.685 |
| 1.736000000000003 | 0.573 | 0.625 | 0.681 |
| 1.740000000000003 | 0.57 | 0.622 | 0.678 |
| 1.744000000000003 | 0.567 | 0.618 | 0.675 |
| 1.748000000000003 | 0.564 | 0.615 | 0.671 |
| 1.752000000000003 | 0.561 | 0.612 | 0.668 |
| 1.756000000000003 | 0.558 | 0.609 | 0.665 |
| 1.760000000000003 | 0.555 | 0.606 | 0.661 |
| 1.764000000000003 | 0.552 | 0.603 | 0.658 |
| 1.768000000000003 | 0.549 | 0.6 | 0.655 |
| 1.772000000000003 | 0.546 | 0.597 | 0.652 |
| 1.776000000000003 | 0.543 | 0.594 | 0.649 |
| 1.780000000000003 | 0.54 | 0.591 | 0.646 |
| 1.784000000000003 | 0.538 | 0.588 | 0.643 |
| 1.788000000000003 | 0.535 | 0.585 | 0.64 |
| 1.792000000000003 | 0.532 | 0.582 | 0.637 |
| 1.796000000000003 | 0.529 | 0.579 | 0.634 |
| 1.800000000000003 | 0.527 | 0.576 | 0.631 |
| 1.804000000000003 | 0.524 | 0.573 | 0.628 |
| 1.808000000000003 | 0.521 | 0.571 | 0.625 |
| 1.812000000000003 | 0.519 | 0.568 | 0.622 |
| 1.816000000000003 | 0.516 | 0.565 | 0.619 |
| 1.820000000000003 | 0.514 | 0.563 | 0.616 |
| 1.824000000000003 | 0.511 | 0.56 | 0.613 |
| 1.828000000000003 | 0.509 | 0.557 | 0.61 |
| 1.832000000000003 | 0.506 | 0.555 | 0.608 |
| 1.836000000000003 | 0.504 | 0.552 | 0.605 |
| 1.840000000000003 | 0.501 | 0.549 | 0.602 |
| 1.844000000000003 | 0.499 | 0.547 | 0.6 |
| 1.848000000000003 | 0.496 | 0.544 | 0.597 |
| 1.852000000000003 | 0.494 | 0.542 | 0.594 |
| 1.856000000000003 | 0.491 | 0.539 | 0.592 |
| 1.860000000000003 | 0.489 | 0.537 | 0.589 |
| 1.864000000000003 | 0.487 | 0.534 | 0.586 |
| 1.868000000000003 | 0.484 | 0.532 | 0.584 |
| 1.872000000000003 | 0.482 | 0.529 | 0.581 |
| 1.876000000000003 | 0.48 | 0.527 | 0.579 |
| 1.880000000000003 | 0.478 | 0.525 | 0.576 |
| 1.884000000000003 | 0.475 | 0.522 | 0.574 |
| 1.888000000000003 | 0.473 | 0.52 | 0.571 |
| 1.892000000000003 | 0.471 | 0.518 | 0.569 |
| 1.896000000000003 | 0.469 | 0.515 | 0.567 |
| 1.900000000000003 | 0.467 | 0.513 | 0.564 |
| 1.904000000000003 | 0.464 | 0.511 | 0.562 |
| 1.908000000000003 | 0.462 | 0.509 | 0.559 |
| 1.912000000000003 | 0.46 | 0.506 | 0.557 |
| 1.916000000000003 | 0.458 | 0.504 | 0.555 |
| 1.920000000000003 | 0.456 | 0.502 | 0.553 |
| 1.924000000000003 | 0.454 | 0.5 | 0.55 |
| 1.928000000000003 | 0.452 | 0.498 | 0.548 |
| 1.932000000000003 | 0.45 | 0.495 | 0.546 |
| 1.936000000000003 | 0.448 | 0.493 | 0.544 |
| 1.940000000000003 | 0.446 | 0.491 | 0.541 |
| 1.944000000000003 | 0.444 | 0.489 | 0.539 |
| 1.948000000000003 | 0.442 | 0.487 | 0.537 |
| 1.952000000000003 | 0.44 | 0.485 | 0.535 |
| 1.956000000000003 | 0.438 | 0.483 | 0.533 |
| 1.960000000000003 | 0.436 | 0.481 | 0.531 |
| 1.964000000000003 | 0.434 | 0.479 | 0.528 |
| 1.968000000000003 | 0.432 | 0.477 | 0.526 |
| 1.972000000000003 | 0.431 | 0.475 | 0.524 |
| 1.976000000000003 | 0.429 | 0.473 | 0.522 |
| 1.980000000000003 | 0.427 | 0.471 | 0.52 |
| 1.984000000000003 | 0.425 | 0.469 | 0.518 |
| 1.988000000000003 | 0.423 | 0.467 | 0.516 |
| 1.992000000000003 | 0.421 | 0.466 | 0.514 |
| 1.996000000000003 | 0.42 | 0.464 | 0.512 |
| 2.000000000000003 | 0.418 | 0.462 | 0.51 |
| 2.004000000000003 | 0.416 | 0.46 | 0.508 |
| 2.008000000000003 | 0.414 | 0.458 | 0.507 |
| 2.012000000000003 | 0.413 | 0.456 | 0.505 |
| 2.016000000000003 | 0.411 | 0.455 | 0.503 |
| 2.020000000000003 | 0.409 | 0.453 | 0.501 |
| 2.024000000000003 | 0.408 | 0.451 | 0.499 |
| 2.028000000000003 | 0.406 | 0.449 | 0.497 |
| 2.032000000000003 | 0.404 | 0.447 | 0.495 |
| 2.036000000000003 | 0.403 | 0.446 | 0.494 |
| 2.040000000000003 | 0.401 | 0.444 | 0.492 |
| 2.044000000000003 | 0.399 | 0.442 | 0.49 |
| 2.048000000000003 | 0.398 | 0.441 | 0.488 |
| 2.052000000000003 | 0.396 | 0.439 | 0.486 |
| 2.056000000000003 | 0.395 | 0.437 | 0.485 |
| 2.060000000000003 | 0.393 | 0.436 | 0.483 |
| 2.064000000000003 | 0.391 | 0.434 | 0.481 |
| 2.068000000000003 | 0.39 | 0.432 | 0.48 |
| 2.072000000000003 | 0.388 | 0.431 | 0.478 |
| 2.076000000000003 | 0.387 | 0.429 | 0.476 |
| 2.080000000000003 | 0.385 | 0.428 | 0.475 |
| 2.084000000000003 | 0.384 | 0.426 | 0.473 |
| 2.088000000000003 | 0.382 | 0.425 | 0.471 |
| 2.092000000000003 | 0.381 | 0.423 | 0.47 |
| 2.096000000000003 | 0.379 | 0.421 | 0.468 |
| 2.100000000000003 | 0.378 | 0.42 | 0.466 |
| 2.104000000000003 | 0.377 | 0.418 | 0.465 |
| 2.108000000000003 | 0.375 | 0.417 | 0.463 |
| 2.112000000000003 | 0.374 | 0.415 | 0.462 |
| 2.116000000000003 | 0.372 | 0.414 | 0.46 |
| 2.120000000000003 | 0.371 | 0.412 | 0.459 |
| 2.124000000000003 | 0.37 | 0.411 | 0.457 |
| 2.128000000000003 | 0.368 | 0.41 | 0.456 |
| 2.132000000000003 | 0.367 | 0.408 | 0.454 |
| 2.136000000000003 | 0.365 | 0.407 | 0.453 |
| 2.140000000000003 | 0.364 | 0.405 | 0.451 |
| 2.144000000000003 | 0.363 | 0.404 | 0.45 |
| 2.148000000000003 | 0.361 | 0.402 | 0.448 |
| 2.152000000000003 | 0.36 | 0.401 | 0.447 |
| 2.156000000000003 | 0.359 | 0.4 | 0.445 |
| 2.160000000000003 | 0.358 | 0.398 | 0.444 |
| 2.164000000000003 | 0.356 | 0.397 | 0.442 |
| 2.168000000000003 | 0.355 | 0.396 | 0.441 |
| 2.172000000000003 | 0.354 | 0.394 | 0.44 |
| 2.176000000000003 | 0.352 | 0.393 | 0.438 |
| 2.180000000000003 | 0.351 | 0.392 | 0.437 |
| 2.184000000000003 | 0.35 | 0.39 | 0.435 |
| 2.188000000000003 | 0.349 | 0.389 | 0.434 |
| 2.192000000000003 | 0.348 | 0.388 | 0.433 |
| 2.196000000000003 | 0.346 | 0.387 | 0.431 |
| 2.200000000000003 | 0.345 | 0.385 | 0.43 |
| 2.204000000000003 | 0.344 | 0.384 | 0.429 |
| 2.208000000000003 | 0.343 | 0.383 | 0.427 |
| 2.212000000000003 | 0.342 | 0.382 | 0.426 |
| 2.216000000000003 | 0.34 | 0.38 | 0.425 |
| 2.220000000000003 | 0.339 | 0.379 | 0.424 |
| 2.224000000000003 | 0.338 | 0.378 | 0.422 |
| 2.228000000000003 | 0.337 | 0.377 | 0.421 |
| 2.232000000000003 | 0.336 | 0.375 | 0.42 |
| 2.236000000000003 | 0.335 | 0.374 | 0.419 |
| 2.240000000000003 | 0.334 | 0.373 | 0.417 |
| 2.244000000000003 | 0.332 | 0.372 | 0.416 |
| 2.248000000000003 | 0.331 | 0.371 | 0.415 |
| 2.252000000000003 | 0.33 | 0.37 | 0.414 |
| 2.256000000000003 | 0.329 | 0.368 | 0.412 |
| 2.260000000000003 | 0.328 | 0.367 | 0.411 |
| 2.264000000000003 | 0.327 | 0.366 | 0.41 |
| 2.268000000000003 | 0.326 | 0.365 | 0.409 |
| 2.272000000000003 | 0.325 | 0.364 | 0.408 |
| 2.276000000000003 | 0.324 | 0.363 | 0.407 |
| 2.280000000000003 | 0.323 | 0.362 | 0.405 |
| 2.284000000000003 | 0.322 | 0.361 | 0.404 |
| 2.288000000000003 | 0.321 | 0.36 | 0.403 |
| 2.292000000000003 | 0.32 | 0.359 | 0.402 |
| 2.296000000000003 | 0.319 | 0.357 | 0.401 |
| 2.300000000000003 | 0.318 | 0.356 | 0.4 |
| 2.304000000000003 | 0.317 | 0.355 | 0.399 |
| 2.308000000000003 | 0.316 | 0.354 | 0.398 |
| 2.312000000000003 | 0.315 | 0.353 | 0.397 |
| 2.316000000000003 | 0.314 | 0.352 | 0.396 |
| 2.320000000000003 | 0.313 | 0.351 | 0.394 |
| 2.324000000000003 | 0.312 | 0.35 | 0.393 |
| 2.328000000000003 | 0.311 | 0.349 | 0.392 |
| 2.332000000000003 | 0.31 | 0.348 | 0.391 |
| 2.336000000000003 | 0.309 | 0.347 | 0.39 |
| 2.340000000000003 | 0.308 | 0.346 | 0.389 |
| 2.344000000000003 | 0.307 | 0.345 | 0.388 |
| 2.348000000000003 | 0.306 | 0.344 | 0.387 |
| 2.352000000000003 | 0.305 | 0.343 | 0.386 |
| 2.356000000000003 | 0.304 | 0.342 | 0.385 |
| 2.360000000000003 | 0.303 | 0.341 | 0.384 |
| 2.364000000000003 | 0.303 | 0.34 | 0.383 |
| 2.368000000000003 | 0.302 | 0.34 | 0.382 |
| 2.372000000000003 | 0.301 | 0.339 | 0.381 |
| 2.376000000000003 | 0.3 | 0.338 | 0.38 |
| 2.380000000000003 | 0.299 | 0.337 | 0.379 |
| 2.384000000000003 | 0.298 | 0.336 | 0.378 |
| 2.388000000000003 | 0.297 | 0.335 | 0.377 |
| 2.392000000000003 | 0.296 | 0.334 | 0.376 |
| 2.396000000000003 | 0.296 | 0.333 | 0.376 |
| 2.400000000000003 | 0.295 | 0.332 | 0.375 |
| 2.404000000000003 | 0.294 | 0.331 | 0.374 |
| 2.408000000000003 | 0.293 | 0.33 | 0.373 |
| 2.412000000000003 | 0.292 | 0.33 | 0.372 |
| 2.416000000000003 | 0.291 | 0.329 | 0.371 |
| 2.420000000000003 | 0.291 | 0.328 | 0.37 |
| 2.424000000000003 | 0.29 | 0.327 | 0.369 |
| 2.428000000000003 | 0.289 | 0.326 | 0.368 |
| 2.432000000000003 | 0.288 | 0.325 | 0.367 |
| 2.436000000000003 | 0.287 | 0.325 | 0.367 |
| 2.440000000000003 | 0.287 | 0.324 | 0.366 |
| 2.444000000000003 | 0.286 | 0.323 | 0.365 |
| 2.448000000000003 | 0.285 | 0.322 | 0.364 |
| 2.452000000000003 | 0.284 | 0.321 | 0.363 |
| 2.456000000000003 | 0.283 | 0.32 | 0.362 |
| 2.460000000000003 | 0.283 | 0.32 | 0.361 |
| 2.464000000000003 | 0.282 | 0.319 | 0.361 |
| 2.468000000000003 | 0.281 | 0.318 | 0.36 |
| 2.472000000000003 | 0.28 | 0.317 | 0.359 |
| 2.476000000000004 | 0.28 | 0.316 | 0.358 |
| 2.480000000000003 | 0.279 | 0.316 | 0.357 |
| 2.484000000000003 | 0.278 | 0.315 | 0.357 |
| 2.488000000000004 | 0.277 | 0.314 | 0.356 |
| 2.492000000000003 | 0.277 | 0.313 | 0.355 |
| 2.496000000000004 | 0.276 | 0.313 | 0.354 |
| 2.500000000000004 | 0.275 | 0.312 | 0.353 |
| 2.504000000000004 | 0.275 | 0.311 | 0.353 |
| 2.508000000000004 | 0.274 | 0.31 | 0.352 |
| 2.512000000000004 | 0.273 | 0.31 | 0.351 |
| 2.516000000000004 | 0.272 | 0.309 | 0.35 |
| 2.520000000000004 | 0.272 | 0.308 | 0.35 |
| 2.524000000000004 | 0.271 | 0.307 | 0.349 |
| 2.528000000000004 | 0.27 | 0.307 | 0.348 |
| 2.532000000000004 | 0.27 | 0.306 | 0.347 |
| 2.536000000000004 | 0.269 | 0.305 | 0.347 |
| 2.540000000000004 | 0.268 | 0.305 | 0.346 |
| 2.544000000000004 | 0.268 | 0.304 | 0.345 |
| 2.548000000000004 | 0.267 | 0.303 | 0.344 |
| 2.552000000000004 | 0.266 | 0.303 | 0.344 |
| 2.556000000000004 | 0.266 | 0.302 | 0.343 |
| 2.560000000000004 | 0.265 | 0.301 | 0.342 |
| 2.564000000000004 | 0.264 | 0.301 | 0.342 |
| 2.568000000000004 | 0.264 | 0.3 | 0.341 |
| 2.572000000000004 | 0.263 | 0.299 | 0.34 |
| 2.576000000000004 | 0.262 | 0.299 | 0.34 |
| 2.580000000000004 | 0.262 | 0.298 | 0.339 |
| 2.584000000000004 | 0.261 | 0.297 | 0.338 |
| 2.588000000000004 | 0.261 | 0.297 | 0.338 |
| 2.592000000000004 | 0.26 | 0.296 | 0.337 |
| 2.596000000000004 | 0.259 | 0.295 | 0.336 |
| 2.600000000000004 | 0.259 | 0.295 | 0.336 |
| 2.604000000000004 | 0.258 | 0.294 | 0.335 |
| 2.608000000000004 | 0.258 | 0.293 | 0.334 |
| 2.612000000000004 | 0.257 | 0.293 | 0.334 |
| 2.616000000000004 | 0.256 | 0.292 | 0.333 |
| 2.620000000000004 | 0.256 | 0.292 | 0.332 |
| 2.624000000000004 | 0.255 | 0.291 | 0.332 |
| 2.628000000000004 | 0.255 | 0.29 | 0.331 |
| 2.632000000000004 | 0.254 | 0.29 | 0.33 |
| 2.636000000000004 | 0.253 | 0.289 | 0.33 |
| 2.640000000000004 | 0.253 | 0.288 | 0.329 |
| 2.644000000000004 | 0.252 | 0.288 | 0.329 |
| 2.648000000000004 | 0.252 | 0.287 | 0.328 |
| 2.652000000000004 | 0.251 | 0.287 | 0.327 |
| 2.656000000000004 | 0.251 | 0.286 | 0.327 |
| 2.660000000000004 | 0.25 | 0.286 | 0.326 |
| 2.664000000000004 | 0.249 | 0.285 | 0.326 |
| 2.668000000000004 | 0.249 | 0.284 | 0.325 |
| 2.672000000000004 | 0.248 | 0.284 | 0.324 |
| 2.676000000000004 | 0.248 | 0.283 | 0.324 |
| 2.680000000000004 | 0.247 | 0.283 | 0.323 |
| 2.684000000000004 | 0.247 | 0.282 | 0.323 |
| 2.688000000000004 | 0.246 | 0.282 | 0.322 |
| 2.692000000000004 | 0.246 | 0.281 | 0.322 |
| 2.696000000000004 | 0.245 | 0.281 | 0.321 |
| 2.700000000000004 | 0.245 | 0.28 | 0.32 |
| 2.704000000000004 | 0.244 | 0.279 | 0.32 |
| 2.708000000000004 | 0.244 | 0.279 | 0.319 |
| 2.712000000000004 | 0.243 | 0.278 | 0.319 |
| 2.716000000000004 | 0.243 | 0.278 | 0.318 |
| 2.720000000000004 | 0.242 | 0.277 | 0.318 |
| 2.724000000000004 | 0.242 | 0.277 | 0.317 |
| 2.728000000000004 | 0.241 | 0.276 | 0.317 |
| 2.732000000000004 | 0.241 | 0.276 | 0.316 |
| 2.736000000000004 | 0.24 | 0.275 | 0.316 |
| 2.740000000000004 | 0.24 | 0.275 | 0.315 |
| 2.744000000000004 | 0.239 | 0.274 | 0.315 |
| 2.748000000000004 | 0.239 | 0.274 | 0.314 |
| 2.752000000000004 | 0.238 | 0.273 | 0.314 |
| 2.756000000000004 | 0.238 | 0.273 | 0.313 |
| 2.760000000000004 | 0.237 | 0.272 | 0.313 |
| 2.764000000000004 | 0.237 | 0.272 | 0.312 |
| 2.768000000000004 | 0.236 | 0.271 | 0.312 |
| 2.772000000000004 | 0.236 | 0.271 | 0.311 |
| 2.776000000000004 | 0.235 | 0.27 | 0.311 |
| 2.780000000000004 | 0.235 | 0.27 | 0.31 |
| 2.784000000000004 | 0.234 | 0.269 | 0.31 |
| 2.788000000000004 | 0.234 | 0.269 | 0.309 |
| 2.792000000000004 | 0.233 | 0.268 | 0.309 |
| 2.796000000000004 | 0.233 | 0.268 | 0.308 |
| 2.800000000000004 | 0.233 | 0.268 | 0.308 |
| 2.804000000000004 | 0.232 | 0.267 | 0.307 |
| 2.808000000000004 | 0.232 | 0.267 | 0.307 |
| 2.812000000000004 | 0.231 | 0.266 | 0.306 |
| 2.816000000000004 | 0.231 | 0.266 | 0.306 |
| 2.820000000000004 | 0.23 | 0.265 | 0.305 |
| 2.824000000000004 | 0.23 | 0.265 | 0.305 |
| 2.828000000000004 | 0.23 | 0.264 | 0.305 |
| 2.832000000000004 | 0.229 | 0.264 | 0.304 |
| 2.836000000000004 | 0.229 | 0.264 | 0.304 |
| 2.840000000000004 | 0.228 | 0.263 | 0.303 |
| 2.844000000000004 | 0.228 | 0.263 | 0.303 |
| 2.848000000000004 | 0.227 | 0.262 | 0.302 |
| 2.852000000000004 | 0.227 | 0.262 | 0.302 |
| 2.856000000000004 | 0.227 | 0.261 | 0.302 |
| 2.860000000000004 | 0.226 | 0.261 | 0.301 |
| 2.864000000000004 | 0.226 | 0.261 | 0.301 |
| 2.868000000000004 | 0.225 | 0.26 | 0.3 |
| 2.872000000000004 | 0.225 | 0.26 | 0.3 |
| 2.876000000000004 | 0.225 | 0.259 | 0.299 |
| 2.880000000000004 | 0.224 | 0.259 | 0.299 |
| 2.884000000000004 | 0.224 | 0.259 | 0.299 |
| 2.888000000000004 | 0.223 | 0.258 | 0.298 |
| 2.892000000000004 | 0.223 | 0.258 | 0.298 |
| 2.896000000000004 | 0.223 | 0.257 | 0.297 |
| 2.900000000000004 | 0.222 | 0.257 | 0.297 |
| 2.904000000000004 | 0.222 | 0.257 | 0.297 |
| 2.908000000000004 | 0.222 | 0.256 | 0.296 |
| 2.912000000000004 | 0.221 | 0.256 | 0.296 |
| 2.916000000000004 | 0.221 | 0.255 | 0.296 |
| 2.920000000000004 | 0.22 | 0.255 | 0.295 |
| 2.924000000000004 | 0.22 | 0.255 | 0.295 |
| 2.928000000000004 | 0.22 | 0.254 | 0.294 |
| 2.932000000000004 | 0.219 | 0.254 | 0.294 |
| 2.936000000000004 | 0.219 | 0.254 | 0.294 |
| 2.940000000000004 | 0.219 | 0.253 | 0.293 |
| 2.944000000000004 | 0.218 | 0.253 | 0.293 |
| 2.948000000000004 | 0.218 | 0.252 | 0.293 |
| 2.952000000000004 | 0.218 | 0.252 | 0.292 |
| 2.956000000000004 | 0.217 | 0.252 | 0.292 |
| 2.960000000000004 | 0.217 | 0.251 | 0.291 |
| 2.964000000000004 | 0.216 | 0.251 | 0.291 |
| 2.968000000000004 | 0.216 | 0.251 | 0.291 |
| 2.972000000000004 | 0.216 | 0.25 | 0.29 |
| 2.976000000000004 | 0.215 | 0.25 | 0.29 |
| 2.980000000000004 | 0.215 | 0.25 | 0.29 |
| 2.984000000000004 | 0.215 | 0.249 | 0.289 |
| 2.988000000000004 | 0.214 | 0.249 | 0.289 |
| 2.992000000000004 | 0.214 | 0.249 | 0.289 |
| 2.996000000000004 | 0.214 | 0.248 | 0.288 |
| 3.000000000000004 | 0.213 | 0.248 | 0.288 |
| 3.004000000000004 | 0.213 | 0.248 | 0.288 |
| 3.008000000000004 | 0.213 | 0.247 | 0.287 |
| 3.012000000000004 | 0.212 | 0.247 | 0.287 |
| 3.016000000000004 | 0.212 | 0.247 | 0.287 |
| 3.020000000000004 | 0.212 | 0.246 | 0.286 |
| 3.024000000000004 | 0.212 | 0.246 | 0.286 |
| 3.028000000000004 | 0.211 | 0.246 | 0.286 |
| 3.032000000000004 | 0.211 | 0.245 | 0.286 |
| 3.036000000000004 | 0.211 | 0.245 | 0.285 |
| 3.040000000000004 | 0.21 | 0.245 | 0.285 |
| 3.044000000000004 | 0.21 | 0.244 | 0.285 |
| 3.048000000000004 | 0.21 | 0.244 | 0.284 |
| 3.052000000000004 | 0.209 | 0.244 | 0.284 |
| 3.056000000000004 | 0.209 | 0.244 | 0.284 |
| 3.060000000000004 | 0.209 | 0.243 | 0.283 |
| 3.064000000000004 | 0.208 | 0.243 | 0.283 |
| 3.068000000000004 | 0.208 | 0.243 | 0.283 |
| 3.072000000000004 | 0.208 | 0.242 | 0.283 |
| 3.076000000000004 | 0.208 | 0.242 | 0.282 |
| 3.080000000000004 | 0.207 | 0.242 | 0.282 |
| 3.084000000000004 | 0.207 | 0.241 | 0.282 |
| 3.088000000000004 | 0.207 | 0.241 | 0.281 |
| 3.092000000000004 | 0.206 | 0.241 | 0.281 |
| 3.096000000000004 | 0.206 | 0.241 | 0.281 |
| 3.100000000000004 | 0.206 | 0.24 | 0.281 |
| 3.104000000000004 | 0.206 | 0.24 | 0.28 |
| 3.108000000000004 | 0.205 | 0.24 | 0.28 |
| 3.112000000000004 | 0.205 | 0.24 | 0.28 |
| 3.116000000000004 | 0.205 | 0.239 | 0.28 |
| 3.120000000000004 | 0.204 | 0.239 | 0.279 |
| 3.124000000000004 | 0.204 | 0.239 | 0.279 |
| 3.128000000000004 | 0.204 | 0.238 | 0.279 |
| 3.132000000000004 | 0.204 | 0.238 | 0.279 |
| 3.136000000000004 | 0.203 | 0.238 | 0.278 |
| 3.140000000000004 | 0.203 | 0.238 | 0.278 |
| 3.144000000000004 | 0.203 | 0.237 | 0.278 |
| 3.148000000000004 | 0.203 | 0.237 | 0.278 |
| 3.152000000000004 | 0.202 | 0.237 | 0.277 |
| 3.156000000000004 | 0.202 | 0.237 | 0.277 |
| 3.160000000000004 | 0.202 | 0.236 | 0.277 |
| 3.164000000000004 | 0.202 | 0.236 | 0.277 |
| 3.168000000000004 | 0.201 | 0.236 | 0.276 |
| 3.172000000000004 | 0.201 | 0.236 | 0.276 |
| 3.176000000000004 | 0.201 | 0.235 | 0.276 |
| 3.180000000000004 | 0.201 | 0.235 | 0.276 |
| 3.184000000000004 | 0.2 | 0.235 | 0.275 |
| 3.188000000000004 | 0.2 | 0.235 | 0.275 |
| 3.192000000000004 | 0.2 | 0.234 | 0.275 |
| 3.196000000000004 | 0.2 | 0.234 | 0.275 |
| 3.200000000000004 | 0.199 | 0.234 | 0.275 |
| 3.204000000000004 | 0.199 | 0.234 | 0.274 |
| 3.208000000000004 | 0.199 | 0.233 | 0.274 |
| 3.212000000000004 | 0.199 | 0.233 | 0.274 |
| 3.216000000000004 | 0.198 | 0.233 | 0.274 |
| 3.220000000000004 | 0.198 | 0.233 | 0.273 |
| 3.224000000000004 | 0.198 | 0.233 | 0.273 |
| 3.228000000000004 | 0.198 | 0.232 | 0.273 |
| 3.232000000000004 | 0.198 | 0.232 | 0.273 |
| 3.236000000000004 | 0.197 | 0.232 | 0.273 |
| 3.240000000000004 | 0.197 | 0.232 | 0.272 |
| 3.244000000000004 | 0.197 | 0.231 | 0.272 |
| 3.248000000000004 | 0.197 | 0.231 | 0.272 |
| 3.252000000000004 | 0.196 | 0.231 | 0.272 |
| 3.256000000000004 | 0.196 | 0.231 | 0.272 |
| 3.260000000000004 | 0.196 | 0.231 | 0.271 |
| 3.264000000000004 | 0.196 | 0.23 | 0.271 |
| 3.268000000000004 | 0.196 | 0.23 | 0.271 |
| 3.272000000000004 | 0.195 | 0.23 | 0.271 |
| 3.276000000000004 | 0.195 | 0.23 | 0.271 |
| 3.280000000000004 | 0.195 | 0.23 | 0.271 |
| 3.284000000000004 | 0.195 | 0.229 | 0.27 |
| 3.288000000000004 | 0.194 | 0.229 | 0.27 |
| 3.292000000000004 | 0.194 | 0.229 | 0.27 |
| 3.296000000000004 | 0.194 | 0.229 | 0.27 |
| 3.300000000000004 | 0.194 | 0.229 | 0.27 |
| 3.304000000000004 | 0.194 | 0.228 | 0.269 |
| 3.308000000000004 | 0.193 | 0.228 | 0.269 |
| 3.312000000000004 | 0.193 | 0.228 | 0.269 |
| 3.316000000000004 | 0.193 | 0.228 | 0.269 |
| 3.320000000000004 | 0.193 | 0.228 | 0.269 |
| 3.324000000000004 | 0.193 | 0.227 | 0.269 |
| 3.328000000000004 | 0.192 | 0.227 | 0.268 |
| 3.332000000000004 | 0.192 | 0.227 | 0.268 |
| 3.336000000000004 | 0.192 | 0.227 | 0.268 |
| 3.340000000000004 | 0.192 | 0.227 | 0.268 |
| 3.344000000000004 | 0.192 | 0.227 | 0.268 |
| 3.348000000000004 | 0.192 | 0.226 | 0.268 |
| 3.352000000000004 | 0.191 | 0.226 | 0.268 |
| 3.356000000000004 | 0.191 | 0.226 | 0.267 |
| 3.360000000000004 | 0.191 | 0.226 | 0.267 |
| 3.364000000000004 | 0.191 | 0.226 | 0.267 |
| 3.368000000000004 | 0.191 | 0.226 | 0.267 |
| 3.372000000000004 | 0.19 | 0.225 | 0.267 |
| 3.376000000000004 | 0.19 | 0.225 | 0.267 |
| 3.380000000000004 | 0.19 | 0.225 | 0.266 |
| 3.384000000000004 | 0.19 | 0.225 | 0.266 |
| 3.388000000000004 | 0.19 | 0.225 | 0.266 |
| 3.392000000000004 | 0.19 | 0.225 | 0.266 |
| 3.396000000000004 | 0.189 | 0.224 | 0.266 |
| 3.400000000000004 | 0.189 | 0.224 | 0.266 |
| 3.404000000000004 | 0.189 | 0.224 | 0.266 |
| 3.408000000000004 | 0.189 | 0.224 | 0.266 |
| 3.412000000000004 | 0.189 | 0.224 | 0.265 |
| 3.416000000000004 | 0.188 | 0.224 | 0.265 |
| 3.420000000000004 | 0.188 | 0.223 | 0.265 |
| 3.424000000000004 | 0.188 | 0.223 | 0.265 |
| 3.428000000000004 | 0.188 | 0.223 | 0.265 |
| 3.432000000000004 | 0.188 | 0.223 | 0.265 |
| 3.436000000000004 | 0.188 | 0.223 | 0.265 |
| 3.440000000000004 | 0.188 | 0.223 | 0.265 |
| 3.444000000000004 | 0.187 | 0.223 | 0.264 |
| 3.448000000000004 | 0.187 | 0.222 | 0.264 |
| 3.452000000000004 | 0.187 | 0.222 | 0.264 |
| 3.456000000000004 | 0.187 | 0.222 | 0.264 |
| 3.460000000000004 | 0.187 | 0.222 | 0.264 |
| 3.464000000000004 | 0.187 | 0.222 | 0.264 |
| 3.468000000000004 | 0.186 | 0.222 | 0.264 |
| 3.472000000000004 | 0.186 | 0.222 | 0.264 |
| 3.476000000000004 | 0.186 | 0.221 | 0.263 |
| 3.480000000000004 | 0.186 | 0.221 | 0.263 |
| 3.484000000000004 | 0.186 | 0.221 | 0.263 |
| 3.488000000000004 | 0.186 | 0.221 | 0.263 |
| 3.492000000000004 | 0.186 | 0.221 | 0.263 |
| 3.496000000000004 | 0.185 | 0.221 | 0.263 |
| 3.500000000000004 | 0.185 | 0.221 | 0.263 |
| 3.504000000000004 | 0.185 | 0.221 | 0.263 |
| 3.508000000000004 | 0.185 | 0.22 | 0.263 |
| 3.512000000000004 | 0.185 | 0.22 | 0.263 |
| 3.516000000000004 | 0.185 | 0.22 | 0.263 |
| 3.520000000000004 | 0.185 | 0.22 | 0.262 |
| 3.524000000000004 | 0.184 | 0.22 | 0.262 |
| 3.528000000000004 | 0.184 | 0.22 | 0.262 |
| 3.532000000000004 | 0.184 | 0.22 | 0.262 |
| 3.536000000000004 | 0.184 | 0.22 | 0.262 |
| 3.540000000000004 | 0.184 | 0.219 | 0.262 |
| 3.544000000000004 | 0.184 | 0.219 | 0.262 |
| 3.548000000000004 | 0.184 | 0.219 | 0.262 |
| 3.552000000000004 | 0.183 | 0.219 | 0.262 |
| 3.556000000000004 | 0.183 | 0.219 | 0.262 |
| 3.560000000000004 | 0.183 | 0.219 | 0.262 |
| 3.564000000000004 | 0.183 | 0.219 | 0.261 |
| 3.568000000000004 | 0.183 | 0.219 | 0.261 |
| 3.572000000000004 | 0.183 | 0.219 | 0.261 |
| 3.576000000000004 | 0.183 | 0.218 | 0.261 |
| 3.580000000000004 | 0.183 | 0.218 | 0.261 |
| 3.584000000000004 | 0.182 | 0.218 | 0.261 |
| 3.588000000000005 | 0.182 | 0.218 | 0.261 |
| 3.592000000000004 | 0.182 | 0.218 | 0.261 |
| 3.596000000000004 | 0.182 | 0.218 | 0.261 |
| 3.600000000000004 | 0.182 | 0.218 | 0.261 |
| 3.604000000000004 | 0.182 | 0.218 | 0.261 |
| 3.608000000000004 | 0.182 | 0.218 | 0.261 |
| 3.612000000000004 | 0.182 | 0.218 | 0.261 |
| 3.616000000000004 | 0.182 | 0.218 | 0.261 |
| 3.620000000000004 | 0.181 | 0.217 | 0.261 |
| 3.624000000000004 | 0.181 | 0.217 | 0.261 |
| 3.628000000000004 | 0.181 | 0.217 | 0.26 |
| 3.632000000000004 | 0.181 | 0.217 | 0.26 |
| 3.636000000000004 | 0.181 | 0.217 | 0.26 |
| 3.640000000000004 | 0.181 | 0.217 | 0.26 |
| 3.644000000000004 | 0.181 | 0.217 | 0.26 |
| 3.648000000000004 | 0.181 | 0.217 | 0.26 |
| 3.652000000000004 | 0.181 | 0.217 | 0.26 |
| 3.656000000000004 | 0.18 | 0.217 | 0.26 |
| 3.660000000000004 | 0.18 | 0.217 | 0.26 |
| 3.664000000000004 | 0.18 | 0.216 | 0.26 |
| 3.668000000000004 | 0.18 | 0.216 | 0.26 |
| 3.672000000000004 | 0.18 | 0.216 | 0.26 |
| 3.676000000000004 | 0.18 | 0.216 | 0.26 |
| 3.680000000000004 | 0.18 | 0.216 | 0.26 |
| 3.684000000000004 | 0.18 | 0.216 | 0.26 |
| 3.688000000000005 | 0.18 | 0.216 | 0.26 |
| 3.692000000000004 | 0.18 | 0.216 | 0.26 |
| 3.696000000000004 | 0.179 | 0.216 | 0.26 |
| 3.700000000000005 | 0.179 | 0.216 | 0.26 |
| 3.704000000000005 | 0.179 | 0.216 | 0.26 |
| 3.708000000000005 | 0.179 | 0.216 | 0.26 |
| 3.712000000000005 | 0.179 | 0.216 | 0.26 |
| 3.716000000000005 | 0.179 | 0.216 | 0.26 |
| 3.720000000000005 | 0.179 | 0.215 | 0.26 |
| 3.724000000000005 | 0.179 | 0.215 | 0.26 |
| 3.728000000000005 | 0.179 | 0.215 | 0.259 |
| 3.732000000000005 | 0.179 | 0.215 | 0.259 |
| 3.736000000000005 | 0.179 | 0.215 | 0.259 |
| 3.740000000000005 | 0.178 | 0.215 | 0.259 |
| 3.744000000000005 | 0.178 | 0.215 | 0.259 |
| 3.748000000000005 | 0.178 | 0.215 | 0.259 |
| 3.752000000000005 | 0.178 | 0.215 | 0.259 |
| 3.756000000000005 | 0.178 | 0.215 | 0.259 |
| 3.760000000000005 | 0.178 | 0.215 | 0.259 |
| 3.764000000000005 | 0.178 | 0.215 | 0.259 |
| 3.768000000000005 | 0.178 | 0.215 | 0.259 |
| 3.772000000000005 | 0.178 | 0.215 | 0.259 |
| 3.776000000000005 | 0.178 | 0.215 | 0.259 |
| 3.780000000000005 | 0.178 | 0.215 | 0.259 |
| 3.784000000000005 | 0.178 | 0.215 | 0.259 |
| 3.788000000000005 | 0.178 | 0.215 | 0.259 |
| 3.792000000000005 | 0.177 | 0.214 | 0.259 |
| 3.796000000000005 | 0.177 | 0.214 | 0.259 |
| 3.800000000000005 | 0.177 | 0.214 | 0.259 |
| 3.804000000000005 | 0.177 | 0.214 | 0.259 |
| 3.808000000000005 | 0.177 | 0.214 | 0.259 |
| 3.812000000000005 | 0.177 | 0.214 | 0.259 |
| 3.816000000000005 | 0.177 | 0.214 | 0.259 |
| 3.820000000000005 | 0.177 | 0.214 | 0.259 |
| 3.824000000000005 | 0.177 | 0.214 | 0.259 |
| 3.828000000000005 | 0.177 | 0.214 | 0.259 |
| 3.832000000000005 | 0.177 | 0.214 | 0.259 |
| 3.836000000000005 | 0.177 | 0.214 | 0.259 |
| 3.840000000000005 | 0.177 | 0.214 | 0.259 |
| 3.844000000000005 | 0.177 | 0.214 | 0.259 |
| 3.848000000000005 | 0.176 | 0.214 | 0.259 |
| 3.852000000000005 | 0.176 | 0.214 | 0.259 |
| 3.856000000000005 | 0.176 | 0.214 | 0.259 |
| 3.860000000000005 | 0.176 | 0.214 | 0.259 |
| 3.864000000000005 | 0.176 | 0.214 | 0.259 |
| 3.868000000000005 | 0.176 | 0.214 | 0.259 |
| 3.872000000000005 | 0.176 | 0.214 | 0.259 |
| 3.876000000000005 | 0.176 | 0.214 | 0.259 |
| 3.880000000000005 | 0.176 | 0.214 | 0.259 |
| 3.884000000000005 | 0.176 | 0.214 | 0.259 |
| 3.888000000000005 | 0.176 | 0.214 | 0.259 |
| 3.892000000000005 | 0.176 | 0.214 | 0.259 |
| 3.896000000000005 | 0.176 | 0.214 | 0.259 |
| 3.900000000000005 | 0.176 | 0.214 | 0.26 |
| 3.904000000000005 | 0.176 | 0.214 | 0.26 |
| 3.908000000000005 | 0.176 | 0.214 | 0.26 |
| 3.912000000000005 | 0.176 | 0.213 | 0.26 |
| 3.916000000000005 | 0.176 | 0.213 | 0.26 |
| 3.920000000000005 | 0.175 | 0.213 | 0.26 |
| 3.924000000000005 | 0.175 | 0.213 | 0.26 |
| 3.928000000000005 | 0.175 | 0.213 | 0.26 |
| 3.932000000000005 | 0.175 | 0.213 | 0.26 |
| 3.936000000000005 | 0.175 | 0.213 | 0.26 |
| 3.940000000000005 | 0.175 | 0.213 | 0.26 |
| 3.944000000000005 | 0.175 | 0.213 | 0.26 |
| 3.948000000000005 | 0.175 | 0.213 | 0.26 |
| 3.952000000000005 | 0.175 | 0.213 | 0.26 |
| 3.956000000000005 | 0.175 | 0.213 | 0.26 |
| 3.960000000000005 | 0.175 | 0.213 | 0.26 |
| 3.964000000000005 | 0.175 | 0.213 | 0.26 |
| 3.968000000000005 | 0.175 | 0.213 | 0.26 |
| 3.972000000000005 | 0.175 | 0.213 | 0.26 |
| 3.976000000000005 | 0.175 | 0.213 | 0.26 |
| 3.980000000000005 | 0.175 | 0.213 | 0.26 |
| 3.984000000000005 | 0.175 | 0.213 | 0.26 |
| 3.988000000000005 | 0.175 | 0.213 | 0.26 |
| 3.992000000000005 | 0.175 | 0.213 | 0.26 |
| 3.996000000000005 | 0.175 | 0.213 | 0.26 |
| 4.000000000000004 | 0.175 | 0.213 | 0.26 |
| 4.004000000000004 | 0.175 | 0.213 | 0.261 |
| 4.008000000000004 | 0.175 | 0.213 | 0.261 |
| 4.012000000000003 | 0.175 | 0.213 | 0.261 |
| 4.016000000000003 | 0.174 | 0.213 | 0.261 |
| 4.020000000000002 | 0.174 | 0.213 | 0.261 |
| 4.024000000000002 | 0.174 | 0.213 | 0.261 |
| 4.028000000000001 | 0.174 | 0.213 | 0.261 |
| 4.032000000000001 | 0.174 | 0.213 | 0.261 |
| 4.036 | 0.174 | 0.213 | 0.261 |
| 4.04 | 0.174 | 0.213 | 0.261 |
| 4.044 | 0.174 | 0.213 | 0.261 |
| 4.047999999999999 | 0.174 | 0.213 | 0.261 |
| 4.051999999999999 | 0.174 | 0.213 | 0.261 |
| 4.055999999999998 | 0.174 | 0.213 | 0.261 |
| 4.059999999999998 | 0.174 | 0.213 | 0.261 |
| 4.063999999999997 | 0.174 | 0.213 | 0.261 |
| 4.067999999999997 | 0.174 | 0.213 | 0.262 |
| 4.071999999999996 | 0.174 | 0.213 | 0.262 |
| 4.075999999999996 | 0.174 | 0.213 | 0.262 |
| 4.079999999999995 | 0.174 | 0.213 | 0.262 |
| 4.083999999999995 | 0.174 | 0.213 | 0.262 |
| 4.087999999999995 | 0.174 | 0.213 | 0.262 |
| 4.091999999999994 | 0.174 | 0.213 | 0.262 |
| 4.095999999999994 | 0.174 | 0.214 | 0.262 |
| 4.099999999999993 | 0.174 | 0.214 | 0.262 |
| 4.103999999999993 | 0.174 | 0.214 | 0.262 |
| 4.107999999999993 | 0.174 | 0.214 | 0.262 |
| 4.111999999999992 | 0.174 | 0.214 | 0.262 |
| 4.115999999999992 | 0.174 | 0.214 | 0.262 |
| 4.119999999999991 | 0.174 | 0.214 | 0.263 |
| 4.123999999999991 | 0.174 | 0.214 | 0.263 |
| 4.12799999999999 | 0.174 | 0.214 | 0.263 |
| 4.13199999999999 | 0.174 | 0.214 | 0.263 |
| 4.135999999999989 | 0.174 | 0.214 | 0.263 |
| 4.13999999999999 | 0.174 | 0.214 | 0.263 |
| 4.143999999999989 | 0.174 | 0.214 | 0.263 |
| 4.147999999999988 | 0.174 | 0.214 | 0.263 |
| 4.151999999999988 | 0.174 | 0.214 | 0.263 |
| 4.155999999999987 | 0.174 | 0.214 | 0.263 |
| 4.159999999999987 | 0.174 | 0.214 | 0.263 |
| 4.163999999999986 | 0.174 | 0.214 | 0.263 |
| 4.167999999999986 | 0.174 | 0.214 | 0.264 |
| 4.171999999999985 | 0.174 | 0.214 | 0.264 |
| 4.175999999999985 | 0.174 | 0.214 | 0.264 |
| 4.179999999999984 | 0.174 | 0.214 | 0.264 |
| 4.183999999999984 | 0.174 | 0.214 | 0.264 |
| 4.187999999999984 | 0.174 | 0.214 | 0.264 |
| 4.191999999999983 | 0.174 | 0.214 | 0.264 |
| 4.195999999999983 | 0.174 | 0.214 | 0.264 |
| 4.199999999999982 | 0.174 | 0.214 | 0.264 |
| 4.203999999999982 | 0.174 | 0.214 | 0.264 |
| 4.207999999999982 | 0.174 | 0.214 | 0.265 |
| 4.211999999999981 | 0.174 | 0.214 | 0.265 |
| 4.215999999999981 | 0.174 | 0.214 | 0.265 |
| 4.21999999999998 | 0.174 | 0.215 | 0.265 |
| 4.22399999999998 | 0.174 | 0.215 | 0.265 |
| 4.227999999999979 | 0.174 | 0.215 | 0.265 |
| 4.231999999999978 | 0.174 | 0.215 | 0.265 |
| 4.235999999999978 | 0.174 | 0.215 | 0.265 |
| 4.239999999999977 | 0.174 | 0.215 | 0.265 |
| 4.243999999999977 | 0.174 | 0.215 | 0.266 |
| 4.247999999999977 | 0.174 | 0.215 | 0.266 |
| 4.251999999999976 | 0.174 | 0.215 | 0.266 |
| 4.255999999999976 | 0.174 | 0.215 | 0.266 |
| 4.259999999999975 | 0.174 | 0.215 | 0.266 |
| 4.263999999999975 | 0.174 | 0.215 | 0.266 |
| 4.267999999999975 | 0.174 | 0.215 | 0.266 |
| 4.271999999999974 | 0.174 | 0.215 | 0.266 |
| 4.275999999999974 | 0.174 | 0.215 | 0.267 |
| 4.279999999999973 | 0.174 | 0.215 | 0.267 |
| 4.283999999999973 | 0.174 | 0.215 | 0.267 |
| 4.287999999999973 | 0.174 | 0.215 | 0.267 |
| 4.291999999999972 | 0.174 | 0.215 | 0.267 |
| 4.295999999999972 | 0.174 | 0.216 | 0.267 |
| 4.299999999999971 | 0.174 | 0.216 | 0.267 |
| 4.303999999999971 | 0.174 | 0.216 | 0.267 |
| 4.30799999999997 | 0.174 | 0.216 | 0.268 |
| 4.31199999999997 | 0.174 | 0.216 | 0.268 |
| 4.31599999999997 | 0.174 | 0.216 | 0.268 |
| 4.31999999999997 | 0.174 | 0.216 | 0.268 |
| 4.323999999999969 | 0.174 | 0.216 | 0.268 |
| 4.327999999999968 | 0.174 | 0.216 | 0.268 |
| 4.331999999999967 | 0.174 | 0.216 | 0.268 |
| 4.335999999999967 | 0.174 | 0.216 | 0.268 |
| 4.339999999999966 | 0.174 | 0.216 | 0.269 |
| 4.343999999999966 | 0.174 | 0.216 | 0.269 |
| 4.347999999999966 | 0.174 | 0.216 | 0.269 |
| 4.351999999999965 | 0.174 | 0.216 | 0.269 |
| 4.355999999999965 | 0.174 | 0.216 | 0.269 |
| 4.359999999999964 | 0.174 | 0.217 | 0.269 |
| 4.363999999999964 | 0.174 | 0.217 | 0.269 |
| 4.367999999999964 | 0.174 | 0.217 | 0.27 |
| 4.371999999999963 | 0.174 | 0.217 | 0.27 |
| 4.375999999999963 | 0.174 | 0.217 | 0.27 |
| 4.379999999999962 | 0.174 | 0.217 | 0.27 |
| 4.383999999999962 | 0.174 | 0.217 | 0.27 |
| 4.387999999999962 | 0.174 | 0.217 | 0.27 |
| 4.391999999999961 | 0.174 | 0.217 | 0.27 |
| 4.395999999999961 | 0.174 | 0.217 | 0.271 |
| 4.39999999999996 | 0.174 | 0.217 | 0.271 |
| 4.40399999999996 | 0.174 | 0.217 | 0.271 |
| 4.407999999999959 | 0.174 | 0.217 | 0.271 |
| 4.41199999999996 | 0.174 | 0.218 | 0.271 |
| 4.415999999999959 | 0.175 | 0.218 | 0.271 |
| 4.419999999999958 | 0.175 | 0.218 | 0.272 |
| 4.423999999999958 | 0.175 | 0.218 | 0.272 |
| 4.427999999999957 | 0.175 | 0.218 | 0.272 |
| 4.431999999999956 | 0.175 | 0.218 | 0.272 |
| 4.435999999999956 | 0.175 | 0.218 | 0.272 |
| 4.439999999999955 | 0.175 | 0.218 | 0.272 |
| 4.443999999999955 | 0.175 | 0.218 | 0.273 |
| 4.447999999999955 | 0.175 | 0.218 | 0.273 |
| 4.451999999999954 | 0.175 | 0.218 | 0.273 |
| 4.455999999999954 | 0.175 | 0.218 | 0.273 |
| 4.459999999999954 | 0.175 | 0.219 | 0.273 |
| 4.463999999999953 | 0.175 | 0.219 | 0.273 |
| 4.467999999999953 | 0.175 | 0.219 | 0.274 |
| 4.471999999999952 | 0.175 | 0.219 | 0.274 |
| 4.475999999999952 | 0.175 | 0.219 | 0.274 |
| 4.479999999999951 | 0.175 | 0.219 | 0.274 |
| 4.483999999999951 | 0.175 | 0.219 | 0.274 |
| 4.487999999999951 | 0.175 | 0.219 | 0.274 |
| 4.49199999999995 | 0.175 | 0.219 | 0.275 |
| 4.49599999999995 | 0.175 | 0.219 | 0.275 |
| 4.49999999999995 | 0.175 | 0.22 | 0.275 |
| 4.503999999999949 | 0.175 | 0.22 | 0.275 |
| 4.507999999999948 | 0.175 | 0.22 | 0.275 |
| 4.511999999999948 | 0.175 | 0.22 | 0.275 |
| 4.515999999999948 | 0.175 | 0.22 | 0.276 |
| 4.519999999999947 | 0.176 | 0.22 | 0.276 |
| 4.523999999999947 | 0.176 | 0.22 | 0.276 |
| 4.527999999999946 | 0.176 | 0.22 | 0.276 |
| 4.531999999999945 | 0.176 | 0.22 | 0.276 |
| 4.535999999999945 | 0.176 | 0.22 | 0.277 |
| 4.539999999999944 | 0.176 | 0.221 | 0.277 |
| 4.543999999999944 | 0.176 | 0.221 | 0.277 |
| 4.547999999999944 | 0.176 | 0.221 | 0.277 |
| 4.551999999999944 | 0.176 | 0.221 | 0.277 |
| 4.555999999999943 | 0.176 | 0.221 | 0.277 |
| 4.559999999999943 | 0.176 | 0.221 | 0.278 |
| 4.563999999999942 | 0.176 | 0.221 | 0.278 |
| 4.567999999999942 | 0.176 | 0.221 | 0.278 |
| 4.571999999999941 | 0.176 | 0.221 | 0.278 |
| 4.575999999999941 | 0.176 | 0.222 | 0.278 |
| 4.57999999999994 | 0.176 | 0.222 | 0.279 |
| 4.58399999999994 | 0.176 | 0.222 | 0.279 |
| 4.58799999999994 | 0.176 | 0.222 | 0.279 |
| 4.59199999999994 | 0.176 | 0.222 | 0.279 |
| 4.595999999999939 | 0.176 | 0.222 | 0.279 |
| 4.599999999999938 | 0.177 | 0.222 | 0.28 |
| 4.603999999999938 | 0.177 | 0.222 | 0.28 |
| 4.607999999999937 | 0.177 | 0.222 | 0.28 |
| 4.611999999999937 | 0.177 | 0.223 | 0.28 |
| 4.615999999999937 | 0.177 | 0.223 | 0.28 |
| 4.619999999999936 | 0.177 | 0.223 | 0.281 |
| 4.623999999999936 | 0.177 | 0.223 | 0.281 |
| 4.627999999999935 | 0.177 | 0.223 | 0.281 |
| 4.631999999999934 | 0.177 | 0.223 | 0.281 |
| 4.635999999999934 | 0.177 | 0.223 | 0.282 |
| 4.639999999999934 | 0.177 | 0.223 | 0.282 |
| 4.643999999999933 | 0.177 | 0.224 | 0.282 |
| 4.647999999999933 | 0.177 | 0.224 | 0.282 |
| 4.651999999999933 | 0.177 | 0.224 | 0.282 |
| 4.655999999999932 | 0.177 | 0.224 | 0.283 |
| 4.659999999999932 | 0.177 | 0.224 | 0.283 |
| 4.663999999999931 | 0.178 | 0.224 | 0.283 |
| 4.667999999999931 | 0.178 | 0.224 | 0.283 |
| 4.67199999999993 | 0.178 | 0.224 | 0.283 |
| 4.67599999999993 | 0.178 | 0.225 | 0.284 |
| 4.67999999999993 | 0.178 | 0.225 | 0.284 |
| 4.68399999999993 | 0.178 | 0.225 | 0.284 |
| 4.687999999999929 | 0.178 | 0.225 | 0.284 |
| 4.691999999999928 | 0.178 | 0.225 | 0.285 |
| 4.695999999999928 | 0.178 | 0.225 | 0.285 |
| 4.699999999999927 | 0.178 | 0.225 | 0.285 |
| 4.703999999999926 | 0.178 | 0.225 | 0.285 |
| 4.707999999999926 | 0.178 | 0.226 | 0.285 |
| 4.711999999999925 | 0.178 | 0.226 | 0.286 |
| 4.715999999999925 | 0.178 | 0.226 | 0.286 |
| 4.719999999999925 | 0.178 | 0.226 | 0.286 |
| 4.723999999999924 | 0.179 | 0.226 | 0.286 |
| 4.727999999999924 | 0.179 | 0.226 | 0.287 |
| 4.731999999999923 | 0.179 | 0.226 | 0.287 |
| 4.735999999999923 | 0.179 | 0.227 | 0.287 |
| 4.739999999999922 | 0.179 | 0.227 | 0.287 |
| 4.743999999999922 | 0.179 | 0.227 | 0.288 |
| 4.747999999999922 | 0.179 | 0.227 | 0.288 |
| 4.751999999999921 | 0.179 | 0.227 | 0.288 |
| 4.755999999999921 | 0.179 | 0.227 | 0.288 |
| 4.75999999999992 | 0.179 | 0.227 | 0.289 |
| 4.76399999999992 | 0.179 | 0.228 | 0.289 |
| 4.76799999999992 | 0.179 | 0.228 | 0.289 |
| 4.77199999999992 | 0.179 | 0.228 | 0.289 |
| 4.775999999999919 | 0.18 | 0.228 | 0.289 |
| 4.779999999999918 | 0.18 | 0.228 | 0.29 |
| 4.783999999999918 | 0.18 | 0.228 | 0.29 |
| 4.787999999999918 | 0.18 | 0.228 | 0.29 |
| 4.791999999999917 | 0.18 | 0.229 | 0.29 |
| 4.795999999999917 | 0.18 | 0.229 | 0.291 |
| 4.799999999999916 | 0.18 | 0.229 | 0.291 |
| 4.803999999999916 | 0.18 | 0.229 | 0.291 |
| 4.807999999999915 | 0.18 | 0.229 | 0.291 |
| 4.811999999999915 | 0.18 | 0.229 | 0.292 |
| 4.815999999999915 | 0.18 | 0.23 | 0.292 |
| 4.819999999999914 | 0.18 | 0.23 | 0.292 |
| 4.823999999999914 | 0.181 | 0.23 | 0.293 |
| 4.827999999999913 | 0.181 | 0.23 | 0.293 |
| 4.831999999999913 | 0.181 | 0.23 | 0.293 |
| 4.835999999999912 | 0.181 | 0.23 | 0.293 |
| 4.839999999999912 | 0.181 | 0.23 | 0.294 |
| 4.843999999999911 | 0.181 | 0.231 | 0.294 |
| 4.847999999999911 | 0.181 | 0.231 | 0.294 |
| 4.851999999999911 | 0.181 | 0.231 | 0.294 |
| 4.85599999999991 | 0.181 | 0.231 | 0.295 |
| 4.85999999999991 | 0.181 | 0.231 | 0.295 |
| 4.863999999999909 | 0.181 | 0.231 | 0.295 |
| 4.867999999999909 | 0.182 | 0.232 | 0.295 |
| 4.871999999999908 | 0.182 | 0.232 | 0.296 |
| 4.875999999999908 | 0.182 | 0.232 | 0.296 |
| 4.879999999999907 | 0.182 | 0.232 | 0.296 |
| 4.883999999999907 | 0.182 | 0.232 | 0.297 |
| 4.887999999999907 | 0.182 | 0.232 | 0.297 |
| 4.891999999999906 | 0.182 | 0.233 | 0.297 |
| 4.895999999999906 | 0.182 | 0.233 | 0.297 |
| 4.899999999999905 | 0.182 | 0.233 | 0.298 |
| 4.903999999999904 | 0.182 | 0.233 | 0.298 |
| 4.907999999999904 | 0.183 | 0.233 | 0.298 |
| 4.911999999999904 | 0.183 | 0.233 | 0.298 |
| 4.915999999999904 | 0.183 | 0.234 | 0.299 |
| 4.919999999999903 | 0.183 | 0.234 | 0.299 |
| 4.923999999999903 | 0.183 | 0.234 | 0.299 |
| 4.927999999999902 | 0.183 | 0.234 | 0.3 |
| 4.931999999999901 | 0.183 | 0.234 | 0.3 |
| 4.935999999999901 | 0.183 | 0.235 | 0.3 |
| 4.9399999999999 | 0.183 | 0.235 | 0.3 |
| 4.9439999999999 | 0.183 | 0.235 | 0.301 |
| 4.9479999999999 | 0.184 | 0.235 | 0.301 |
| 4.9519999999999 | 0.184 | 0.235 | 0.301 |
| 4.9559999999999 | 0.184 | 0.235 | 0.302 |
| 4.959999999999898 | 0.184 | 0.236 | 0.302 |
| 4.963999999999898 | 0.184 | 0.236 | 0.302 |
| 4.967999999999898 | 0.184 | 0.236 | 0.303 |
| 4.971999999999897 | 0.184 | 0.236 | 0.303 |
| 4.975999999999896 | 0.184 | 0.236 | 0.303 |
| 4.979999999999896 | 0.184 | 0.237 | 0.303 |
| 4.983999999999896 | 0.184 | 0.237 | 0.304 |
| 4.987999999999895 | 0.185 | 0.237 | 0.304 |
| 4.991999999999895 | 0.185 | 0.237 | 0.304 |
| 4.995999999999894 | 0.185 | 0.237 | 0.305 |
| 4.999999999999894 | 0.185 | 0.237 | 0.305 |
| 5.003999999999894 | 0.185 | 0.238 | 0.305 |
| 5.007999999999893 | 0.185 | 0.238 | 0.306 |
| 5.011999999999893 | 0.185 | 0.238 | 0.306 |
| 5.015999999999893 | 0.185 | 0.238 | 0.306 |
| 5.019999999999892 | 0.185 | 0.238 | 0.306 |
| 5.023999999999892 | 0.186 | 0.239 | 0.307 |
| 5.027999999999891 | 0.186 | 0.239 | 0.307 |
| 5.03199999999989 | 0.186 | 0.239 | 0.307 |
| 5.03599999999989 | 0.186 | 0.239 | 0.308 |
| 5.03999999999989 | 0.186 | 0.239 | 0.308 |
| 5.04399999999989 | 0.186 | 0.24 | 0.308 |
| 5.04799999999989 | 0.186 | 0.24 | 0.309 |
| 5.051999999999888 | 0.186 | 0.24 | 0.309 |
| 5.055999999999888 | 0.187 | 0.24 | 0.309 |
| 5.059999999999887 | 0.187 | 0.24 | 0.31 |
| 5.063999999999887 | 0.187 | 0.241 | 0.31 |
| 5.067999999999887 | 0.187 | 0.241 | 0.31 |
| 5.071999999999886 | 0.187 | 0.241 | 0.311 |
| 5.075999999999885 | 0.187 | 0.241 | 0.311 |
| 5.079999999999885 | 0.187 | 0.241 | 0.311 |
| 5.083999999999885 | 0.187 | 0.242 | 0.312 |
| 5.087999999999884 | 0.188 | 0.242 | 0.312 |
| 5.091999999999884 | 0.188 | 0.242 | 0.312 |
| 5.095999999999884 | 0.188 | 0.242 | 0.313 |
| 5.099999999999883 | 0.188 | 0.242 | 0.313 |
| 5.103999999999883 | 0.188 | 0.243 | 0.313 |
| 5.107999999999882 | 0.188 | 0.243 | 0.314 |
| 5.111999999999882 | 0.188 | 0.243 | 0.314 |
| 5.115999999999882 | 0.188 | 0.243 | 0.314 |
| 5.119999999999881 | 0.189 | 0.244 | 0.315 |
| 5.123999999999881 | 0.189 | 0.244 | 0.315 |
| 5.12799999999988 | 0.189 | 0.244 | 0.315 |
| 5.13199999999988 | 0.189 | 0.244 | 0.316 |
| 5.13599999999988 | 0.189 | 0.244 | 0.316 |
| 5.139999999999878 | 0.189 | 0.245 | 0.316 |
| 5.143999999999878 | 0.189 | 0.245 | 0.317 |
| 5.147999999999878 | 0.189 | 0.245 | 0.317 |
| 5.151999999999877 | 0.19 | 0.245 | 0.317 |
| 5.155999999999877 | 0.19 | 0.245 | 0.318 |
| 5.159999999999876 | 0.19 | 0.246 | 0.318 |
| 5.163999999999876 | 0.19 | 0.246 | 0.318 |
| 5.167999999999876 | 0.19 | 0.246 | 0.319 |
| 5.171999999999875 | 0.19 | 0.246 | 0.319 |
| 5.175999999999874 | 0.19 | 0.247 | 0.319 |
| 5.179999999999874 | 0.19 | 0.247 | 0.32 |
| 5.183999999999874 | 0.191 | 0.247 | 0.32 |
| 5.187999999999874 | 0.191 | 0.247 | 0.32 |
| 5.191999999999873 | 0.191 | 0.247 | 0.321 |
| 5.195999999999873 | 0.191 | 0.248 | 0.321 |
| 5.199999999999872 | 0.191 | 0.248 | 0.322 |
| 5.203999999999871 | 0.191 | 0.248 | 0.322 |
| 5.207999999999871 | 0.191 | 0.248 | 0.322 |
| 5.21199999999987 | 0.192 | 0.249 | 0.323 |
| 5.21599999999987 | 0.192 | 0.249 | 0.323 |
| 5.21999999999987 | 0.192 | 0.249 | 0.323 |
| 5.22399999999987 | 0.192 | 0.249 | 0.324 |
| 5.22799999999987 | 0.192 | 0.25 | 0.324 |
| 5.231999999999868 | 0.192 | 0.25 | 0.324 |
| 5.235999999999868 | 0.192 | 0.25 | 0.325 |
| 5.239999999999867 | 0.193 | 0.25 | 0.325 |
| 5.243999999999867 | 0.193 | 0.25 | 0.326 |
| 5.247999999999866 | 0.193 | 0.251 | 0.326 |
| 5.251999999999866 | 0.193 | 0.251 | 0.326 |
| 5.255999999999866 | 0.193 | 0.251 | 0.327 |
| 5.259999999999865 | 0.193 | 0.251 | 0.327 |
| 5.263999999999865 | 0.193 | 0.252 | 0.327 |
| 5.267999999999864 | 0.194 | 0.252 | 0.328 |
| 5.271999999999864 | 0.194 | 0.252 | 0.328 |
| 5.275999999999863 | 0.194 | 0.252 | 0.329 |
| 5.279999999999863 | 0.194 | 0.253 | 0.329 |
| 5.283999999999863 | 0.194 | 0.253 | 0.329 |
| 5.287999999999862 | 0.194 | 0.253 | 0.33 |
| 5.291999999999862 | 0.194 | 0.253 | 0.33 |
| 5.295999999999861 | 0.195 | 0.254 | 0.331 |
| 5.29999999999986 | 0.195 | 0.254 | 0.331 |
| 5.30399999999986 | 0.195 | 0.254 | 0.331 |
| 5.30799999999986 | 0.195 | 0.254 | 0.332 |
| 5.31199999999986 | 0.195 | 0.255 | 0.332 |
| 5.315999999999859 | 0.195 | 0.255 | 0.333 |
| 5.31999999999986 | 0.196 | 0.255 | 0.333 |
| 5.323999999999859 | 0.196 | 0.255 | 0.333 |
| 5.327999999999858 | 0.196 | 0.256 | 0.334 |
| 5.331999999999857 | 0.196 | 0.256 | 0.334 |
| 5.335999999999857 | 0.196 | 0.256 | 0.335 |
| 5.339999999999856 | 0.196 | 0.256 | 0.335 |
| 5.343999999999856 | 0.196 | 0.257 | 0.335 |
| 5.347999999999856 | 0.197 | 0.257 | 0.336 |
| 5.351999999999855 | 0.197 | 0.257 | 0.336 |
| 5.355999999999855 | 0.197 | 0.257 | 0.337 |
| 5.359999999999854 | 0.197 | 0.258 | 0.337 |
| 5.363999999999854 | 0.197 | 0.258 | 0.337 |
| 5.367999999999854 | 0.197 | 0.258 | 0.338 |
| 5.371999999999853 | 0.198 | 0.259 | 0.338 |
| 5.375999999999853 | 0.198 | 0.259 | 0.339 |
| 5.379999999999852 | 0.198 | 0.259 | 0.339 |
| 5.383999999999852 | 0.198 | 0.259 | 0.339 |
| 5.387999999999852 | 0.198 | 0.26 | 0.34 |
| 5.391999999999851 | 0.198 | 0.26 | 0.34 |
| 5.395999999999851 | 0.199 | 0.26 | 0.341 |
| 5.39999999999985 | 0.199 | 0.26 | 0.341 |
| 5.40399999999985 | 0.199 | 0.261 | 0.342 |
| 5.40799999999985 | 0.199 | 0.261 | 0.342 |
| 5.411999999999848 | 0.199 | 0.261 | 0.342 |
| 5.415999999999848 | 0.199 | 0.261 | 0.343 |
| 5.419999999999848 | 0.2 | 0.262 | 0.343 |
| 5.423999999999847 | 0.2 | 0.262 | 0.344 |
| 5.427999999999847 | 0.2 | 0.262 | 0.344 |
| 5.431999999999846 | 0.2 | 0.263 | 0.345 |
| 5.435999999999846 | 0.2 | 0.263 | 0.345 |
| 5.439999999999845 | 0.2 | 0.263 | 0.345 |
| 5.443999999999845 | 0.201 | 0.263 | 0.346 |
| 5.447999999999844 | 0.201 | 0.264 | 0.346 |
| 5.451999999999844 | 0.201 | 0.264 | 0.347 |
| 5.455999999999844 | 0.201 | 0.264 | 0.347 |
| 5.459999999999843 | 0.201 | 0.265 | 0.348 |
| 5.463999999999843 | 0.202 | 0.265 | 0.348 |
| 5.467999999999843 | 0.202 | 0.265 | 0.348 |
| 5.471999999999842 | 0.202 | 0.265 | 0.349 |
| 5.475999999999841 | 0.202 | 0.266 | 0.349 |
| 5.47999999999984 | 0.202 | 0.266 | 0.35 |
| 5.48399999999984 | 0.202 | 0.266 | 0.35 |
| 5.48799999999984 | 0.203 | 0.267 | 0.351 |
| 5.49199999999984 | 0.203 | 0.267 | 0.351 |
| 5.49599999999984 | 0.203 | 0.267 | 0.352 |
| 5.49999999999984 | 0.203 | 0.267 | 0.352 |
| 5.503999999999838 | 0.203 | 0.268 | 0.353 |
| 5.507999999999838 | 0.203 | 0.268 | 0.353 |
| 5.511999999999837 | 0.204 | 0.268 | 0.353 |
| 5.515999999999837 | 0.204 | 0.269 | 0.354 |
| 5.519999999999837 | 0.204 | 0.269 | 0.354 |
| 5.523999999999836 | 0.204 | 0.269 | 0.355 |
| 5.527999999999836 | 0.204 | 0.269 | 0.355 |
| 5.531999999999835 | 0.205 | 0.27 | 0.356 |
| 5.535999999999835 | 0.205 | 0.27 | 0.356 |
| 5.539999999999834 | 0.205 | 0.27 | 0.357 |
| 5.543999999999834 | 0.205 | 0.271 | 0.357 |
| 5.547999999999834 | 0.205 | 0.271 | 0.358 |
| 5.551999999999833 | 0.206 | 0.271 | 0.358 |
| 5.555999999999833 | 0.206 | 0.272 | 0.359 |
| 5.559999999999832 | 0.206 | 0.272 | 0.359 |
| 5.563999999999832 | 0.206 | 0.272 | 0.359 |
| 5.567999999999832 | 0.206 | 0.272 | 0.36 |
| 5.57199999999983 | 0.206 | 0.273 | 0.36 |
| 5.57599999999983 | 0.207 | 0.273 | 0.361 |
| 5.57999999999983 | 0.207 | 0.273 | 0.361 |
| 5.58399999999983 | 0.207 | 0.274 | 0.362 |
| 5.58799999999983 | 0.207 | 0.274 | 0.362 |
| 5.59199999999983 | 0.207 | 0.274 | 0.363 |
| 5.595999999999828 | 0.208 | 0.275 | 0.363 |
| 5.599999999999828 | 0.208 | 0.275 | 0.364 |
| 5.603999999999827 | 0.208 | 0.275 | 0.364 |
| 5.607999999999827 | 0.208 | 0.276 | 0.365 |
| 5.611999999999826 | 0.208 | 0.276 | 0.365 |
| 5.615999999999826 | 0.209 | 0.276 | 0.366 |
| 5.619999999999825 | 0.209 | 0.277 | 0.366 |
| 5.623999999999825 | 0.209 | 0.277 | 0.367 |
| 5.627999999999825 | 0.209 | 0.277 | 0.367 |
| 5.631999999999824 | 0.209 | 0.278 | 0.368 |
| 5.635999999999824 | 0.21 | 0.278 | 0.368 |
| 5.639999999999823 | 0.21 | 0.278 | 0.369 |
| 5.643999999999823 | 0.21 | 0.278 | 0.369 |
| 5.647999999999823 | 0.21 | 0.279 | 0.37 |
| 5.651999999999822 | 0.21 | 0.279 | 0.37 |
| 5.655999999999822 | 0.211 | 0.279 | 0.371 |
| 5.659999999999821 | 0.211 | 0.28 | 0.371 |
| 5.663999999999821 | 0.211 | 0.28 | 0.372 |
| 5.667999999999821 | 0.211 | 0.28 | 0.372 |
| 5.67199999999982 | 0.211 | 0.281 | 0.373 |
| 5.67599999999982 | 0.212 | 0.281 | 0.373 |
| 5.67999999999982 | 0.212 | 0.281 | 0.374 |
| 5.683999999999819 | 0.212 | 0.282 | 0.374 |
| 5.687999999999818 | 0.212 | 0.282 | 0.375 |
| 5.691999999999818 | 0.212 | 0.282 | 0.375 |
| 5.695999999999818 | 0.213 | 0.283 | 0.376 |
| 5.699999999999817 | 0.213 | 0.283 | 0.376 |
| 5.703999999999816 | 0.213 | 0.283 | 0.377 |
| 5.707999999999816 | 0.213 | 0.284 | 0.378 |
| 5.711999999999815 | 0.214 | 0.284 | 0.378 |
| 5.715999999999815 | 0.214 | 0.284 | 0.379 |
| 5.719999999999814 | 0.214 | 0.285 | 0.379 |
| 5.723999999999814 | 0.214 | 0.285 | 0.38 |
| 5.727999999999814 | 0.214 | 0.286 | 0.38 |
| 5.731999999999813 | 0.215 | 0.286 | 0.381 |
| 5.735999999999813 | 0.215 | 0.286 | 0.381 |
| 5.739999999999812 | 0.215 | 0.287 | 0.382 |
| 5.743999999999812 | 0.215 | 0.287 | 0.382 |
| 5.747999999999812 | 0.215 | 0.287 | 0.383 |
| 5.751999999999811 | 0.216 | 0.288 | 0.383 |
| 5.755999999999811 | 0.216 | 0.288 | 0.384 |
| 5.75999999999981 | 0.216 | 0.288 | 0.385 |
| 5.76399999999981 | 0.216 | 0.289 | 0.385 |
| 5.76799999999981 | 0.217 | 0.289 | 0.386 |
| 5.77199999999981 | 0.217 | 0.289 | 0.386 |
| 5.775999999999808 | 0.217 | 0.29 | 0.387 |
| 5.779999999999808 | 0.217 | 0.29 | 0.387 |
| 5.783999999999807 | 0.217 | 0.29 | 0.388 |
| 5.787999999999807 | 0.218 | 0.291 | 0.388 |
| 5.791999999999806 | 0.218 | 0.291 | 0.389 |
| 5.795999999999806 | 0.218 | 0.292 | 0.39 |
| 5.799999999999806 | 0.218 | 0.292 | 0.39 |
| 5.803999999999805 | 0.219 | 0.292 | 0.391 |
| 5.807999999999805 | 0.219 | 0.293 | 0.391 |
| 5.811999999999804 | 0.219 | 0.293 | 0.392 |
| 5.815999999999804 | 0.219 | 0.293 | 0.392 |
| 5.819999999999804 | 0.22 | 0.294 | 0.393 |
| 5.823999999999804 | 0.22 | 0.294 | 0.393 |
| 5.827999999999803 | 0.22 | 0.294 | 0.394 |
| 5.831999999999802 | 0.22 | 0.295 | 0.395 |
| 5.835999999999802 | 0.22 | 0.295 | 0.395 |
| 5.839999999999801 | 0.221 | 0.296 | 0.396 |
| 5.843999999999801 | 0.221 | 0.296 | 0.396 |
| 5.847999999999801 | 0.221 | 0.296 | 0.397 |
| 5.8519999999998 | 0.221 | 0.297 | 0.398 |
| 5.8559999999998 | 0.222 | 0.297 | 0.398 |
| 5.8599999999998 | 0.222 | 0.297 | 0.399 |
| 5.863999999999799 | 0.222 | 0.298 | 0.399 |
| 5.867999999999799 | 0.222 | 0.298 | 0.4 |
| 5.871999999999798 | 0.223 | 0.299 | 0.4 |
| 5.875999999999798 | 0.223 | 0.299 | 0.401 |
| 5.879999999999797 | 0.223 | 0.299 | 0.402 |
| 5.883999999999797 | 0.223 | 0.3 | 0.402 |
| 5.887999999999796 | 0.224 | 0.3 | 0.403 |
| 5.891999999999796 | 0.224 | 0.3 | 0.403 |
| 5.895999999999796 | 0.224 | 0.301 | 0.404 |
| 5.899999999999795 | 0.224 | 0.301 | 0.405 |
| 5.903999999999794 | 0.225 | 0.302 | 0.405 |
| 5.907999999999794 | 0.225 | 0.302 | 0.406 |
| 5.911999999999794 | 0.225 | 0.302 | 0.406 |
| 5.915999999999793 | 0.225 | 0.303 | 0.407 |
| 5.919999999999793 | 0.226 | 0.303 | 0.408 |
| 5.923999999999793 | 0.226 | 0.304 | 0.408 |
| 5.927999999999792 | 0.226 | 0.304 | 0.409 |
| 5.931999999999791 | 0.226 | 0.304 | 0.409 |
| 5.935999999999791 | 0.227 | 0.305 | 0.41 |
| 5.93999999999979 | 0.227 | 0.305 | 0.411 |
| 5.94399999999979 | 0.227 | 0.306 | 0.411 |
| 5.94799999999979 | 0.227 | 0.306 | 0.412 |
| 5.95199999999979 | 0.228 | 0.306 | 0.413 |
| 5.955999999999789 | 0.228 | 0.307 | 0.413 |
| 5.959999999999788 | 0.228 | 0.307 | 0.414 |
| 5.963999999999788 | 0.228 | 0.308 | 0.414 |
| 5.967999999999788 | 0.229 | 0.308 | 0.415 |
| 5.971999999999787 | 0.229 | 0.308 | 0.416 |
| 5.975999999999786 | 0.229 | 0.309 | 0.416 |
| 5.979999999999786 | 0.229 | 0.309 | 0.417 |
| 5.983999999999785 | 0.23 | 0.31 | 0.418 |
| 5.987999999999785 | 0.23 | 0.31 | 0.418 |
| 5.991999999999785 | 0.23 | 0.31 | 0.419 |
| 5.995999999999784 | 0.23 | 0.311 | 0.42 |
| 5.999999999999784 | 0.231 | 0.311 | 0.42 |